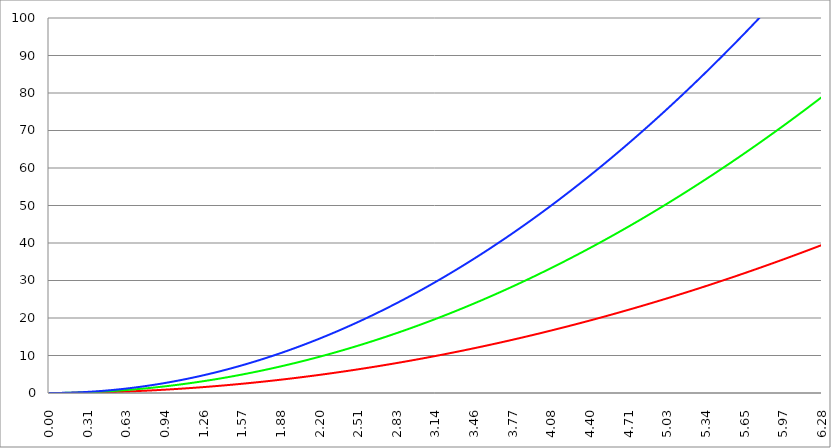
| Category | Series 1 | Series 0 | Series 2 |
|---|---|---|---|
| 0.0 | 0 | 0 | 0 |
| 0.00314159265358979 | 0 | 0 | 0 |
| 0.00628318530717958 | 0 | 0 | 0 |
| 0.00942477796076938 | 0 | 0 | 0 |
| 0.0125663706143592 | 0 | 0 | 0 |
| 0.015707963267949 | 0 | 0 | 0.001 |
| 0.0188495559215388 | 0 | 0.001 | 0.001 |
| 0.0219911485751285 | 0 | 0.001 | 0.001 |
| 0.0251327412287183 | 0.001 | 0.001 | 0.002 |
| 0.0282743338823081 | 0.001 | 0.002 | 0.002 |
| 0.0314159265358979 | 0.001 | 0.002 | 0.003 |
| 0.0345575191894877 | 0.001 | 0.002 | 0.004 |
| 0.0376991118430775 | 0.001 | 0.003 | 0.004 |
| 0.0408407044966673 | 0.002 | 0.003 | 0.005 |
| 0.0439822971502571 | 0.002 | 0.004 | 0.006 |
| 0.0471238898038469 | 0.002 | 0.004 | 0.007 |
| 0.0502654824574367 | 0.003 | 0.005 | 0.008 |
| 0.0534070751110265 | 0.003 | 0.006 | 0.009 |
| 0.0565486677646163 | 0.003 | 0.006 | 0.01 |
| 0.059690260418206 | 0.004 | 0.007 | 0.011 |
| 0.0628318530717958 | 0.004 | 0.008 | 0.012 |
| 0.0659734457253856 | 0.004 | 0.009 | 0.013 |
| 0.0691150383789754 | 0.005 | 0.01 | 0.014 |
| 0.0722566310325652 | 0.005 | 0.01 | 0.016 |
| 0.075398223686155 | 0.006 | 0.011 | 0.017 |
| 0.0785398163397448 | 0.006 | 0.012 | 0.019 |
| 0.0816814089933346 | 0.007 | 0.013 | 0.02 |
| 0.0848230016469244 | 0.007 | 0.014 | 0.022 |
| 0.0879645943005142 | 0.008 | 0.015 | 0.023 |
| 0.091106186954104 | 0.008 | 0.017 | 0.025 |
| 0.0942477796076937 | 0.009 | 0.018 | 0.027 |
| 0.0973893722612835 | 0.009 | 0.019 | 0.028 |
| 0.100530964914873 | 0.01 | 0.02 | 0.03 |
| 0.103672557568463 | 0.011 | 0.021 | 0.032 |
| 0.106814150222053 | 0.011 | 0.023 | 0.034 |
| 0.109955742875643 | 0.012 | 0.024 | 0.036 |
| 0.113097335529233 | 0.013 | 0.026 | 0.038 |
| 0.116238928182822 | 0.014 | 0.027 | 0.041 |
| 0.119380520836412 | 0.014 | 0.029 | 0.043 |
| 0.122522113490002 | 0.015 | 0.03 | 0.045 |
| 0.125663706143592 | 0.016 | 0.032 | 0.047 |
| 0.128805298797181 | 0.017 | 0.033 | 0.05 |
| 0.131946891450771 | 0.017 | 0.035 | 0.052 |
| 0.135088484104361 | 0.018 | 0.036 | 0.055 |
| 0.138230076757951 | 0.019 | 0.038 | 0.057 |
| 0.141371669411541 | 0.02 | 0.04 | 0.06 |
| 0.14451326206513 | 0.021 | 0.042 | 0.063 |
| 0.14765485471872 | 0.022 | 0.044 | 0.065 |
| 0.15079644737231 | 0.023 | 0.045 | 0.068 |
| 0.1539380400259 | 0.024 | 0.047 | 0.071 |
| 0.15707963267949 | 0.025 | 0.049 | 0.074 |
| 0.160221225333079 | 0.026 | 0.051 | 0.077 |
| 0.163362817986669 | 0.027 | 0.053 | 0.08 |
| 0.166504410640259 | 0.028 | 0.055 | 0.083 |
| 0.169646003293849 | 0.029 | 0.058 | 0.086 |
| 0.172787595947439 | 0.03 | 0.06 | 0.09 |
| 0.175929188601028 | 0.031 | 0.062 | 0.093 |
| 0.179070781254618 | 0.032 | 0.064 | 0.096 |
| 0.182212373908208 | 0.033 | 0.066 | 0.1 |
| 0.185353966561798 | 0.034 | 0.069 | 0.103 |
| 0.188495559215388 | 0.036 | 0.071 | 0.107 |
| 0.191637151868977 | 0.037 | 0.073 | 0.11 |
| 0.194778744522567 | 0.038 | 0.076 | 0.114 |
| 0.197920337176157 | 0.039 | 0.078 | 0.118 |
| 0.201061929829747 | 0.04 | 0.081 | 0.121 |
| 0.204203522483336 | 0.042 | 0.083 | 0.125 |
| 0.207345115136926 | 0.043 | 0.086 | 0.129 |
| 0.210486707790516 | 0.044 | 0.089 | 0.133 |
| 0.213628300444106 | 0.046 | 0.091 | 0.137 |
| 0.216769893097696 | 0.047 | 0.094 | 0.141 |
| 0.219911485751285 | 0.048 | 0.097 | 0.145 |
| 0.223053078404875 | 0.05 | 0.1 | 0.149 |
| 0.226194671058465 | 0.051 | 0.102 | 0.153 |
| 0.229336263712055 | 0.053 | 0.105 | 0.158 |
| 0.232477856365645 | 0.054 | 0.108 | 0.162 |
| 0.235619449019234 | 0.056 | 0.111 | 0.167 |
| 0.238761041672824 | 0.057 | 0.114 | 0.171 |
| 0.241902634326414 | 0.059 | 0.117 | 0.176 |
| 0.245044226980004 | 0.06 | 0.12 | 0.18 |
| 0.248185819633594 | 0.062 | 0.123 | 0.185 |
| 0.251327412287183 | 0.063 | 0.126 | 0.189 |
| 0.254469004940773 | 0.065 | 0.13 | 0.194 |
| 0.257610597594363 | 0.066 | 0.133 | 0.199 |
| 0.260752190247953 | 0.068 | 0.136 | 0.204 |
| 0.263893782901543 | 0.07 | 0.139 | 0.209 |
| 0.267035375555132 | 0.071 | 0.143 | 0.214 |
| 0.270176968208722 | 0.073 | 0.146 | 0.219 |
| 0.273318560862312 | 0.075 | 0.149 | 0.224 |
| 0.276460153515902 | 0.076 | 0.153 | 0.229 |
| 0.279601746169492 | 0.078 | 0.156 | 0.235 |
| 0.282743338823082 | 0.08 | 0.16 | 0.24 |
| 0.285884931476671 | 0.082 | 0.163 | 0.245 |
| 0.289026524130261 | 0.084 | 0.167 | 0.251 |
| 0.292168116783851 | 0.085 | 0.171 | 0.256 |
| 0.295309709437441 | 0.087 | 0.174 | 0.262 |
| 0.298451302091031 | 0.089 | 0.178 | 0.267 |
| 0.30159289474462 | 0.091 | 0.182 | 0.273 |
| 0.30473448739821 | 0.093 | 0.186 | 0.279 |
| 0.3078760800518 | 0.095 | 0.19 | 0.284 |
| 0.31101767270539 | 0.097 | 0.193 | 0.29 |
| 0.31415926535898 | 0.099 | 0.197 | 0.296 |
| 0.31730085801257 | 0.101 | 0.201 | 0.302 |
| 0.320442450666159 | 0.103 | 0.205 | 0.308 |
| 0.323584043319749 | 0.105 | 0.209 | 0.314 |
| 0.326725635973339 | 0.107 | 0.213 | 0.32 |
| 0.329867228626929 | 0.109 | 0.218 | 0.326 |
| 0.333008821280519 | 0.111 | 0.222 | 0.333 |
| 0.336150413934108 | 0.113 | 0.226 | 0.339 |
| 0.339292006587698 | 0.115 | 0.23 | 0.345 |
| 0.342433599241288 | 0.117 | 0.235 | 0.352 |
| 0.345575191894878 | 0.119 | 0.239 | 0.358 |
| 0.348716784548468 | 0.122 | 0.243 | 0.365 |
| 0.351858377202058 | 0.124 | 0.248 | 0.371 |
| 0.354999969855647 | 0.126 | 0.252 | 0.378 |
| 0.358141562509237 | 0.128 | 0.257 | 0.385 |
| 0.361283155162827 | 0.131 | 0.261 | 0.392 |
| 0.364424747816417 | 0.133 | 0.266 | 0.398 |
| 0.367566340470007 | 0.135 | 0.27 | 0.405 |
| 0.370707933123597 | 0.137 | 0.275 | 0.412 |
| 0.373849525777186 | 0.14 | 0.28 | 0.419 |
| 0.376991118430776 | 0.142 | 0.284 | 0.426 |
| 0.380132711084366 | 0.145 | 0.289 | 0.434 |
| 0.383274303737956 | 0.147 | 0.294 | 0.441 |
| 0.386415896391546 | 0.149 | 0.299 | 0.448 |
| 0.389557489045135 | 0.152 | 0.304 | 0.455 |
| 0.392699081698725 | 0.154 | 0.308 | 0.463 |
| 0.395840674352315 | 0.157 | 0.313 | 0.47 |
| 0.398982267005905 | 0.159 | 0.318 | 0.478 |
| 0.402123859659495 | 0.162 | 0.323 | 0.485 |
| 0.405265452313085 | 0.164 | 0.328 | 0.493 |
| 0.408407044966674 | 0.167 | 0.334 | 0.5 |
| 0.411548637620264 | 0.169 | 0.339 | 0.508 |
| 0.414690230273854 | 0.172 | 0.344 | 0.516 |
| 0.417831822927444 | 0.175 | 0.349 | 0.524 |
| 0.420973415581034 | 0.177 | 0.354 | 0.532 |
| 0.424115008234623 | 0.18 | 0.36 | 0.54 |
| 0.427256600888213 | 0.183 | 0.365 | 0.548 |
| 0.430398193541803 | 0.185 | 0.37 | 0.556 |
| 0.433539786195393 | 0.188 | 0.376 | 0.564 |
| 0.436681378848983 | 0.191 | 0.381 | 0.572 |
| 0.439822971502573 | 0.193 | 0.387 | 0.58 |
| 0.442964564156162 | 0.196 | 0.392 | 0.589 |
| 0.446106156809752 | 0.199 | 0.398 | 0.597 |
| 0.449247749463342 | 0.202 | 0.404 | 0.605 |
| 0.452389342116932 | 0.205 | 0.409 | 0.614 |
| 0.455530934770522 | 0.208 | 0.415 | 0.623 |
| 0.458672527424111 | 0.21 | 0.421 | 0.631 |
| 0.461814120077701 | 0.213 | 0.427 | 0.64 |
| 0.464955712731291 | 0.216 | 0.432 | 0.649 |
| 0.468097305384881 | 0.219 | 0.438 | 0.657 |
| 0.471238898038471 | 0.222 | 0.444 | 0.666 |
| 0.474380490692061 | 0.225 | 0.45 | 0.675 |
| 0.47752208334565 | 0.228 | 0.456 | 0.684 |
| 0.48066367599924 | 0.231 | 0.462 | 0.693 |
| 0.48380526865283 | 0.234 | 0.468 | 0.702 |
| 0.48694686130642 | 0.237 | 0.474 | 0.711 |
| 0.49008845396001 | 0.24 | 0.48 | 0.721 |
| 0.493230046613599 | 0.243 | 0.487 | 0.73 |
| 0.496371639267189 | 0.246 | 0.493 | 0.739 |
| 0.499513231920779 | 0.25 | 0.499 | 0.749 |
| 0.502654824574369 | 0.253 | 0.505 | 0.758 |
| 0.505796417227959 | 0.256 | 0.512 | 0.767 |
| 0.508938009881549 | 0.259 | 0.518 | 0.777 |
| 0.512079602535138 | 0.262 | 0.524 | 0.787 |
| 0.515221195188728 | 0.265 | 0.531 | 0.796 |
| 0.518362787842318 | 0.269 | 0.537 | 0.806 |
| 0.521504380495908 | 0.272 | 0.544 | 0.816 |
| 0.524645973149498 | 0.275 | 0.551 | 0.826 |
| 0.527787565803087 | 0.279 | 0.557 | 0.836 |
| 0.530929158456677 | 0.282 | 0.564 | 0.846 |
| 0.534070751110267 | 0.285 | 0.57 | 0.856 |
| 0.537212343763857 | 0.289 | 0.577 | 0.866 |
| 0.540353936417447 | 0.292 | 0.584 | 0.876 |
| 0.543495529071037 | 0.295 | 0.591 | 0.886 |
| 0.546637121724626 | 0.299 | 0.598 | 0.896 |
| 0.549778714378216 | 0.302 | 0.605 | 0.907 |
| 0.552920307031806 | 0.306 | 0.611 | 0.917 |
| 0.556061899685396 | 0.309 | 0.618 | 0.928 |
| 0.559203492338986 | 0.313 | 0.625 | 0.938 |
| 0.562345084992576 | 0.316 | 0.632 | 0.949 |
| 0.565486677646165 | 0.32 | 0.64 | 0.959 |
| 0.568628270299755 | 0.323 | 0.647 | 0.97 |
| 0.571769862953345 | 0.327 | 0.654 | 0.981 |
| 0.574911455606935 | 0.331 | 0.661 | 0.992 |
| 0.578053048260525 | 0.334 | 0.668 | 1.002 |
| 0.581194640914114 | 0.338 | 0.676 | 1.013 |
| 0.584336233567704 | 0.341 | 0.683 | 1.024 |
| 0.587477826221294 | 0.345 | 0.69 | 1.035 |
| 0.590619418874884 | 0.349 | 0.698 | 1.046 |
| 0.593761011528474 | 0.353 | 0.705 | 1.058 |
| 0.596902604182064 | 0.356 | 0.713 | 1.069 |
| 0.600044196835653 | 0.36 | 0.72 | 1.08 |
| 0.603185789489243 | 0.364 | 0.728 | 1.091 |
| 0.606327382142833 | 0.368 | 0.735 | 1.103 |
| 0.609468974796423 | 0.371 | 0.743 | 1.114 |
| 0.612610567450013 | 0.375 | 0.751 | 1.126 |
| 0.615752160103602 | 0.379 | 0.758 | 1.137 |
| 0.618893752757192 | 0.383 | 0.766 | 1.149 |
| 0.622035345410782 | 0.387 | 0.774 | 1.161 |
| 0.625176938064372 | 0.391 | 0.782 | 1.173 |
| 0.628318530717962 | 0.395 | 0.79 | 1.184 |
| 0.631460123371551 | 0.399 | 0.797 | 1.196 |
| 0.634601716025141 | 0.403 | 0.805 | 1.208 |
| 0.637743308678731 | 0.407 | 0.813 | 1.22 |
| 0.640884901332321 | 0.411 | 0.821 | 1.232 |
| 0.644026493985911 | 0.415 | 0.83 | 1.244 |
| 0.647168086639501 | 0.419 | 0.838 | 1.256 |
| 0.65030967929309 | 0.423 | 0.846 | 1.269 |
| 0.65345127194668 | 0.427 | 0.854 | 1.281 |
| 0.65659286460027 | 0.431 | 0.862 | 1.293 |
| 0.65973445725386 | 0.435 | 0.87 | 1.306 |
| 0.66287604990745 | 0.439 | 0.879 | 1.318 |
| 0.666017642561039 | 0.444 | 0.887 | 1.331 |
| 0.669159235214629 | 0.448 | 0.896 | 1.343 |
| 0.672300827868219 | 0.452 | 0.904 | 1.356 |
| 0.675442420521809 | 0.456 | 0.912 | 1.369 |
| 0.678584013175399 | 0.46 | 0.921 | 1.381 |
| 0.681725605828989 | 0.465 | 0.929 | 1.394 |
| 0.684867198482578 | 0.469 | 0.938 | 1.407 |
| 0.688008791136168 | 0.473 | 0.947 | 1.42 |
| 0.691150383789758 | 0.478 | 0.955 | 1.433 |
| 0.694291976443348 | 0.482 | 0.964 | 1.446 |
| 0.697433569096938 | 0.486 | 0.973 | 1.459 |
| 0.700575161750528 | 0.491 | 0.982 | 1.472 |
| 0.703716754404117 | 0.495 | 0.99 | 1.486 |
| 0.706858347057707 | 0.5 | 0.999 | 1.499 |
| 0.709999939711297 | 0.504 | 1.008 | 1.512 |
| 0.713141532364887 | 0.509 | 1.017 | 1.526 |
| 0.716283125018477 | 0.513 | 1.026 | 1.539 |
| 0.719424717672066 | 0.518 | 1.035 | 1.553 |
| 0.722566310325656 | 0.522 | 1.044 | 1.566 |
| 0.725707902979246 | 0.527 | 1.053 | 1.58 |
| 0.728849495632836 | 0.531 | 1.062 | 1.594 |
| 0.731991088286426 | 0.536 | 1.072 | 1.607 |
| 0.735132680940016 | 0.54 | 1.081 | 1.621 |
| 0.738274273593605 | 0.545 | 1.09 | 1.635 |
| 0.741415866247195 | 0.55 | 1.099 | 1.649 |
| 0.744557458900785 | 0.554 | 1.109 | 1.663 |
| 0.747699051554375 | 0.559 | 1.118 | 1.677 |
| 0.750840644207965 | 0.564 | 1.128 | 1.691 |
| 0.753982236861554 | 0.568 | 1.137 | 1.705 |
| 0.757123829515144 | 0.573 | 1.146 | 1.72 |
| 0.760265422168734 | 0.578 | 1.156 | 1.734 |
| 0.763407014822324 | 0.583 | 1.166 | 1.748 |
| 0.766548607475914 | 0.588 | 1.175 | 1.763 |
| 0.769690200129504 | 0.592 | 1.185 | 1.777 |
| 0.772831792783093 | 0.597 | 1.195 | 1.792 |
| 0.775973385436683 | 0.602 | 1.204 | 1.806 |
| 0.779114978090273 | 0.607 | 1.214 | 1.821 |
| 0.782256570743863 | 0.612 | 1.224 | 1.836 |
| 0.785398163397453 | 0.617 | 1.234 | 1.851 |
| 0.788539756051042 | 0.622 | 1.244 | 1.865 |
| 0.791681348704632 | 0.627 | 1.254 | 1.88 |
| 0.794822941358222 | 0.632 | 1.263 | 1.895 |
| 0.797964534011812 | 0.637 | 1.273 | 1.91 |
| 0.801106126665402 | 0.642 | 1.284 | 1.925 |
| 0.804247719318992 | 0.647 | 1.294 | 1.94 |
| 0.807389311972581 | 0.652 | 1.304 | 1.956 |
| 0.810530904626171 | 0.657 | 1.314 | 1.971 |
| 0.813672497279761 | 0.662 | 1.324 | 1.986 |
| 0.816814089933351 | 0.667 | 1.334 | 2.002 |
| 0.819955682586941 | 0.672 | 1.345 | 2.017 |
| 0.823097275240531 | 0.677 | 1.355 | 2.032 |
| 0.82623886789412 | 0.683 | 1.365 | 2.048 |
| 0.82938046054771 | 0.688 | 1.376 | 2.064 |
| 0.8325220532013 | 0.693 | 1.386 | 2.079 |
| 0.83566364585489 | 0.698 | 1.397 | 2.095 |
| 0.83880523850848 | 0.704 | 1.407 | 2.111 |
| 0.841946831162069 | 0.709 | 1.418 | 2.127 |
| 0.845088423815659 | 0.714 | 1.428 | 2.143 |
| 0.848230016469249 | 0.719 | 1.439 | 2.158 |
| 0.851371609122839 | 0.725 | 1.45 | 2.175 |
| 0.854513201776429 | 0.73 | 1.46 | 2.191 |
| 0.857654794430019 | 0.736 | 1.471 | 2.207 |
| 0.860796387083608 | 0.741 | 1.482 | 2.223 |
| 0.863937979737198 | 0.746 | 1.493 | 2.239 |
| 0.867079572390788 | 0.752 | 1.504 | 2.255 |
| 0.870221165044378 | 0.757 | 1.515 | 2.272 |
| 0.873362757697968 | 0.763 | 1.526 | 2.288 |
| 0.876504350351557 | 0.768 | 1.537 | 2.305 |
| 0.879645943005147 | 0.774 | 1.548 | 2.321 |
| 0.882787535658737 | 0.779 | 1.559 | 2.338 |
| 0.885929128312327 | 0.785 | 1.57 | 2.355 |
| 0.889070720965917 | 0.79 | 1.581 | 2.371 |
| 0.892212313619507 | 0.796 | 1.592 | 2.388 |
| 0.895353906273096 | 0.802 | 1.603 | 2.405 |
| 0.898495498926686 | 0.807 | 1.615 | 2.422 |
| 0.901637091580276 | 0.813 | 1.626 | 2.439 |
| 0.904778684233866 | 0.819 | 1.637 | 2.456 |
| 0.907920276887456 | 0.824 | 1.649 | 2.473 |
| 0.911061869541045 | 0.83 | 1.66 | 2.49 |
| 0.914203462194635 | 0.836 | 1.672 | 2.507 |
| 0.917345054848225 | 0.842 | 1.683 | 2.525 |
| 0.920486647501815 | 0.847 | 1.695 | 2.542 |
| 0.923628240155405 | 0.853 | 1.706 | 2.559 |
| 0.926769832808995 | 0.859 | 1.718 | 2.577 |
| 0.929911425462584 | 0.865 | 1.729 | 2.594 |
| 0.933053018116174 | 0.871 | 1.741 | 2.612 |
| 0.936194610769764 | 0.876 | 1.753 | 2.629 |
| 0.939336203423354 | 0.882 | 1.765 | 2.647 |
| 0.942477796076944 | 0.888 | 1.777 | 2.665 |
| 0.945619388730533 | 0.894 | 1.788 | 2.683 |
| 0.948760981384123 | 0.9 | 1.8 | 2.7 |
| 0.951902574037713 | 0.906 | 1.812 | 2.718 |
| 0.955044166691303 | 0.912 | 1.824 | 2.736 |
| 0.958185759344893 | 0.918 | 1.836 | 2.754 |
| 0.961327351998483 | 0.924 | 1.848 | 2.772 |
| 0.964468944652072 | 0.93 | 1.86 | 2.791 |
| 0.967610537305662 | 0.936 | 1.873 | 2.809 |
| 0.970752129959252 | 0.942 | 1.885 | 2.827 |
| 0.973893722612842 | 0.948 | 1.897 | 2.845 |
| 0.977035315266432 | 0.955 | 1.909 | 2.864 |
| 0.980176907920022 | 0.961 | 1.921 | 2.882 |
| 0.983318500573611 | 0.967 | 1.934 | 2.901 |
| 0.986460093227201 | 0.973 | 1.946 | 2.919 |
| 0.989601685880791 | 0.979 | 1.959 | 2.938 |
| 0.992743278534381 | 0.986 | 1.971 | 2.957 |
| 0.995884871187971 | 0.992 | 1.984 | 2.975 |
| 0.99902646384156 | 0.998 | 1.996 | 2.994 |
| 1.00216805649515 | 1.004 | 2.009 | 3.013 |
| 1.00530964914874 | 1.011 | 2.021 | 3.032 |
| 1.00845124180233 | 1.017 | 2.034 | 3.051 |
| 1.01159283445592 | 1.023 | 2.047 | 3.07 |
| 1.01473442710951 | 1.03 | 2.059 | 3.089 |
| 1.017876019763099 | 1.036 | 2.072 | 3.108 |
| 1.021017612416689 | 1.042 | 2.085 | 3.127 |
| 1.02415920507028 | 1.049 | 2.098 | 3.147 |
| 1.027300797723869 | 1.055 | 2.111 | 3.166 |
| 1.030442390377459 | 1.062 | 2.124 | 3.185 |
| 1.033583983031048 | 1.068 | 2.137 | 3.205 |
| 1.036725575684638 | 1.075 | 2.15 | 3.224 |
| 1.039867168338228 | 1.081 | 2.163 | 3.244 |
| 1.043008760991818 | 1.088 | 2.176 | 3.264 |
| 1.046150353645408 | 1.094 | 2.189 | 3.283 |
| 1.049291946298998 | 1.101 | 2.202 | 3.303 |
| 1.052433538952587 | 1.108 | 2.215 | 3.323 |
| 1.055575131606177 | 1.114 | 2.228 | 3.343 |
| 1.058716724259767 | 1.121 | 2.242 | 3.363 |
| 1.061858316913357 | 1.128 | 2.255 | 3.383 |
| 1.064999909566947 | 1.134 | 2.268 | 3.403 |
| 1.068141502220536 | 1.141 | 2.282 | 3.423 |
| 1.071283094874126 | 1.148 | 2.295 | 3.443 |
| 1.074424687527716 | 1.154 | 2.309 | 3.463 |
| 1.077566280181306 | 1.161 | 2.322 | 3.483 |
| 1.080707872834896 | 1.168 | 2.336 | 3.504 |
| 1.083849465488486 | 1.175 | 2.349 | 3.524 |
| 1.086991058142075 | 1.182 | 2.363 | 3.545 |
| 1.090132650795665 | 1.188 | 2.377 | 3.565 |
| 1.093274243449255 | 1.195 | 2.39 | 3.586 |
| 1.096415836102845 | 1.202 | 2.404 | 3.606 |
| 1.099557428756435 | 1.209 | 2.418 | 3.627 |
| 1.102699021410025 | 1.216 | 2.432 | 3.648 |
| 1.105840614063614 | 1.223 | 2.446 | 3.669 |
| 1.108982206717204 | 1.23 | 2.46 | 3.69 |
| 1.112123799370794 | 1.237 | 2.474 | 3.71 |
| 1.115265392024384 | 1.244 | 2.488 | 3.731 |
| 1.118406984677974 | 1.251 | 2.502 | 3.753 |
| 1.121548577331563 | 1.258 | 2.516 | 3.774 |
| 1.124690169985153 | 1.265 | 2.53 | 3.795 |
| 1.127831762638743 | 1.272 | 2.544 | 3.816 |
| 1.130973355292333 | 1.279 | 2.558 | 3.837 |
| 1.134114947945923 | 1.286 | 2.572 | 3.859 |
| 1.137256540599513 | 1.293 | 2.587 | 3.88 |
| 1.140398133253102 | 1.301 | 2.601 | 3.902 |
| 1.143539725906692 | 1.308 | 2.615 | 3.923 |
| 1.146681318560282 | 1.315 | 2.63 | 3.945 |
| 1.149822911213872 | 1.322 | 2.644 | 3.966 |
| 1.152964503867462 | 1.329 | 2.659 | 3.988 |
| 1.156106096521051 | 1.337 | 2.673 | 4.01 |
| 1.159247689174641 | 1.344 | 2.688 | 4.032 |
| 1.162389281828231 | 1.351 | 2.702 | 4.053 |
| 1.165530874481821 | 1.358 | 2.717 | 4.075 |
| 1.168672467135411 | 1.366 | 2.732 | 4.097 |
| 1.171814059789001 | 1.373 | 2.746 | 4.119 |
| 1.17495565244259 | 1.381 | 2.761 | 4.142 |
| 1.17809724509618 | 1.388 | 2.776 | 4.164 |
| 1.18123883774977 | 1.395 | 2.791 | 4.186 |
| 1.18438043040336 | 1.403 | 2.806 | 4.208 |
| 1.18752202305695 | 1.41 | 2.82 | 4.231 |
| 1.190663615710539 | 1.418 | 2.835 | 4.253 |
| 1.193805208364129 | 1.425 | 2.85 | 4.276 |
| 1.19694680101772 | 1.433 | 2.865 | 4.298 |
| 1.200088393671309 | 1.44 | 2.88 | 4.321 |
| 1.203229986324899 | 1.448 | 2.896 | 4.343 |
| 1.206371578978489 | 1.455 | 2.911 | 4.366 |
| 1.209513171632078 | 1.463 | 2.926 | 4.389 |
| 1.212654764285668 | 1.471 | 2.941 | 4.412 |
| 1.215796356939258 | 1.478 | 2.956 | 4.434 |
| 1.218937949592848 | 1.486 | 2.972 | 4.457 |
| 1.222079542246438 | 1.493 | 2.987 | 4.48 |
| 1.225221134900027 | 1.501 | 3.002 | 4.504 |
| 1.228362727553617 | 1.509 | 3.018 | 4.527 |
| 1.231504320207207 | 1.517 | 3.033 | 4.55 |
| 1.234645912860797 | 1.524 | 3.049 | 4.573 |
| 1.237787505514387 | 1.532 | 3.064 | 4.596 |
| 1.240929098167977 | 1.54 | 3.08 | 4.62 |
| 1.244070690821566 | 1.548 | 3.095 | 4.643 |
| 1.247212283475156 | 1.556 | 3.111 | 4.667 |
| 1.250353876128746 | 1.563 | 3.127 | 4.69 |
| 1.253495468782336 | 1.571 | 3.143 | 4.714 |
| 1.256637061435926 | 1.579 | 3.158 | 4.737 |
| 1.259778654089515 | 1.587 | 3.174 | 4.761 |
| 1.262920246743105 | 1.595 | 3.19 | 4.785 |
| 1.266061839396695 | 1.603 | 3.206 | 4.809 |
| 1.269203432050285 | 1.611 | 3.222 | 4.833 |
| 1.272345024703875 | 1.619 | 3.238 | 4.857 |
| 1.275486617357465 | 1.627 | 3.254 | 4.881 |
| 1.278628210011054 | 1.635 | 3.27 | 4.905 |
| 1.281769802664644 | 1.643 | 3.286 | 4.929 |
| 1.284911395318234 | 1.651 | 3.302 | 4.953 |
| 1.288052987971824 | 1.659 | 3.318 | 4.977 |
| 1.291194580625414 | 1.667 | 3.334 | 5.002 |
| 1.294336173279003 | 1.675 | 3.351 | 5.026 |
| 1.297477765932593 | 1.683 | 3.367 | 5.05 |
| 1.300619358586183 | 1.692 | 3.383 | 5.075 |
| 1.303760951239773 | 1.7 | 3.4 | 5.099 |
| 1.306902543893363 | 1.708 | 3.416 | 5.124 |
| 1.310044136546953 | 1.716 | 3.432 | 5.149 |
| 1.313185729200542 | 1.724 | 3.449 | 5.173 |
| 1.316327321854132 | 1.733 | 3.465 | 5.198 |
| 1.319468914507722 | 1.741 | 3.482 | 5.223 |
| 1.322610507161312 | 1.749 | 3.499 | 5.248 |
| 1.325752099814902 | 1.758 | 3.515 | 5.273 |
| 1.328893692468491 | 1.766 | 3.532 | 5.298 |
| 1.332035285122081 | 1.774 | 3.549 | 5.323 |
| 1.335176877775671 | 1.783 | 3.565 | 5.348 |
| 1.338318470429261 | 1.791 | 3.582 | 5.373 |
| 1.341460063082851 | 1.8 | 3.599 | 5.399 |
| 1.344601655736441 | 1.808 | 3.616 | 5.424 |
| 1.34774324839003 | 1.816 | 3.633 | 5.449 |
| 1.35088484104362 | 1.825 | 3.65 | 5.475 |
| 1.35402643369721 | 1.833 | 3.667 | 5.5 |
| 1.3571680263508 | 1.842 | 3.684 | 5.526 |
| 1.36030961900439 | 1.85 | 3.701 | 5.551 |
| 1.363451211657979 | 1.859 | 3.718 | 5.577 |
| 1.36659280431157 | 1.868 | 3.735 | 5.603 |
| 1.369734396965159 | 1.876 | 3.752 | 5.629 |
| 1.372875989618749 | 1.885 | 3.77 | 5.654 |
| 1.376017582272339 | 1.893 | 3.787 | 5.68 |
| 1.379159174925929 | 1.902 | 3.804 | 5.706 |
| 1.382300767579518 | 1.911 | 3.822 | 5.732 |
| 1.385442360233108 | 1.919 | 3.839 | 5.758 |
| 1.388583952886698 | 1.928 | 3.856 | 5.784 |
| 1.391725545540288 | 1.937 | 3.874 | 5.811 |
| 1.394867138193878 | 1.946 | 3.891 | 5.837 |
| 1.398008730847468 | 1.954 | 3.909 | 5.863 |
| 1.401150323501057 | 1.963 | 3.926 | 5.89 |
| 1.404291916154647 | 1.972 | 3.944 | 5.916 |
| 1.407433508808237 | 1.981 | 3.962 | 5.943 |
| 1.410575101461827 | 1.99 | 3.979 | 5.969 |
| 1.413716694115417 | 1.999 | 3.997 | 5.996 |
| 1.416858286769006 | 2.007 | 4.015 | 6.022 |
| 1.419999879422596 | 2.016 | 4.033 | 6.049 |
| 1.423141472076186 | 2.025 | 4.051 | 6.076 |
| 1.426283064729776 | 2.034 | 4.069 | 6.103 |
| 1.429424657383366 | 2.043 | 4.087 | 6.13 |
| 1.432566250036956 | 2.052 | 4.104 | 6.157 |
| 1.435707842690545 | 2.061 | 4.123 | 6.184 |
| 1.438849435344135 | 2.07 | 4.141 | 6.211 |
| 1.441991027997725 | 2.079 | 4.159 | 6.238 |
| 1.445132620651315 | 2.088 | 4.177 | 6.265 |
| 1.448274213304905 | 2.097 | 4.195 | 6.292 |
| 1.451415805958494 | 2.107 | 4.213 | 6.32 |
| 1.454557398612084 | 2.116 | 4.231 | 6.347 |
| 1.457698991265674 | 2.125 | 4.25 | 6.375 |
| 1.460840583919264 | 2.134 | 4.268 | 6.402 |
| 1.463982176572854 | 2.143 | 4.286 | 6.43 |
| 1.467123769226444 | 2.152 | 4.305 | 6.457 |
| 1.470265361880033 | 2.162 | 4.323 | 6.485 |
| 1.473406954533623 | 2.171 | 4.342 | 6.513 |
| 1.476548547187213 | 2.18 | 4.36 | 6.541 |
| 1.479690139840803 | 2.189 | 4.379 | 6.568 |
| 1.482831732494393 | 2.199 | 4.398 | 6.596 |
| 1.485973325147982 | 2.208 | 4.416 | 6.624 |
| 1.489114917801572 | 2.217 | 4.435 | 6.652 |
| 1.492256510455162 | 2.227 | 4.454 | 6.68 |
| 1.495398103108752 | 2.236 | 4.472 | 6.709 |
| 1.498539695762342 | 2.246 | 4.491 | 6.737 |
| 1.501681288415932 | 2.255 | 4.51 | 6.765 |
| 1.504822881069521 | 2.264 | 4.529 | 6.793 |
| 1.507964473723111 | 2.274 | 4.548 | 6.822 |
| 1.511106066376701 | 2.283 | 4.567 | 6.85 |
| 1.514247659030291 | 2.293 | 4.586 | 6.879 |
| 1.517389251683881 | 2.302 | 4.605 | 6.907 |
| 1.520530844337471 | 2.312 | 4.624 | 6.936 |
| 1.52367243699106 | 2.322 | 4.643 | 6.965 |
| 1.52681402964465 | 2.331 | 4.662 | 6.993 |
| 1.52995562229824 | 2.341 | 4.682 | 7.022 |
| 1.53309721495183 | 2.35 | 4.701 | 7.051 |
| 1.53623880760542 | 2.36 | 4.72 | 7.08 |
| 1.539380400259009 | 2.37 | 4.739 | 7.109 |
| 1.542521992912599 | 2.379 | 4.759 | 7.138 |
| 1.545663585566189 | 2.389 | 4.778 | 7.167 |
| 1.548805178219779 | 2.399 | 4.798 | 7.196 |
| 1.551946770873369 | 2.409 | 4.817 | 7.226 |
| 1.555088363526959 | 2.418 | 4.837 | 7.255 |
| 1.558229956180548 | 2.428 | 4.856 | 7.284 |
| 1.561371548834138 | 2.438 | 4.876 | 7.314 |
| 1.564513141487728 | 2.448 | 4.895 | 7.343 |
| 1.567654734141318 | 2.458 | 4.915 | 7.373 |
| 1.570796326794908 | 2.467 | 4.935 | 7.402 |
| 1.573937919448497 | 2.477 | 4.955 | 7.432 |
| 1.577079512102087 | 2.487 | 4.974 | 7.462 |
| 1.580221104755677 | 2.497 | 4.994 | 7.491 |
| 1.583362697409267 | 2.507 | 5.014 | 7.521 |
| 1.586504290062857 | 2.517 | 5.034 | 7.551 |
| 1.589645882716447 | 2.527 | 5.054 | 7.581 |
| 1.592787475370036 | 2.537 | 5.074 | 7.611 |
| 1.595929068023626 | 2.547 | 5.094 | 7.641 |
| 1.599070660677216 | 2.557 | 5.114 | 7.671 |
| 1.602212253330806 | 2.567 | 5.134 | 7.701 |
| 1.605353845984396 | 2.577 | 5.154 | 7.731 |
| 1.608495438637985 | 2.587 | 5.175 | 7.762 |
| 1.611637031291575 | 2.597 | 5.195 | 7.792 |
| 1.614778623945165 | 2.608 | 5.215 | 7.823 |
| 1.617920216598755 | 2.618 | 5.235 | 7.853 |
| 1.621061809252345 | 2.628 | 5.256 | 7.884 |
| 1.624203401905935 | 2.638 | 5.276 | 7.914 |
| 1.627344994559524 | 2.648 | 5.297 | 7.945 |
| 1.630486587213114 | 2.658 | 5.317 | 7.975 |
| 1.633628179866704 | 2.669 | 5.337 | 8.006 |
| 1.636769772520294 | 2.679 | 5.358 | 8.037 |
| 1.639911365173884 | 2.689 | 5.379 | 8.068 |
| 1.643052957827473 | 2.7 | 5.399 | 8.099 |
| 1.646194550481063 | 2.71 | 5.42 | 8.13 |
| 1.649336143134653 | 2.72 | 5.441 | 8.161 |
| 1.652477735788243 | 2.731 | 5.461 | 8.192 |
| 1.655619328441833 | 2.741 | 5.482 | 8.223 |
| 1.658760921095423 | 2.751 | 5.503 | 8.254 |
| 1.661902513749012 | 2.762 | 5.524 | 8.286 |
| 1.665044106402602 | 2.772 | 5.545 | 8.317 |
| 1.668185699056192 | 2.783 | 5.566 | 8.349 |
| 1.671327291709782 | 2.793 | 5.587 | 8.38 |
| 1.674468884363372 | 2.804 | 5.608 | 8.412 |
| 1.677610477016961 | 2.814 | 5.629 | 8.443 |
| 1.680752069670551 | 2.825 | 5.65 | 8.475 |
| 1.683893662324141 | 2.835 | 5.671 | 8.506 |
| 1.687035254977731 | 2.846 | 5.692 | 8.538 |
| 1.690176847631321 | 2.857 | 5.713 | 8.57 |
| 1.693318440284911 | 2.867 | 5.735 | 8.602 |
| 1.6964600329385 | 2.878 | 5.756 | 8.634 |
| 1.69960162559209 | 2.889 | 5.777 | 8.666 |
| 1.70274321824568 | 2.899 | 5.799 | 8.698 |
| 1.70588481089927 | 2.91 | 5.82 | 8.73 |
| 1.70902640355286 | 2.921 | 5.842 | 8.762 |
| 1.712167996206449 | 2.932 | 5.863 | 8.795 |
| 1.715309588860039 | 2.942 | 5.885 | 8.827 |
| 1.71845118151363 | 2.953 | 5.906 | 8.859 |
| 1.721592774167219 | 2.964 | 5.928 | 8.892 |
| 1.724734366820809 | 2.975 | 5.949 | 8.924 |
| 1.727875959474399 | 2.986 | 5.971 | 8.957 |
| 1.731017552127988 | 2.996 | 5.993 | 8.989 |
| 1.734159144781578 | 3.007 | 6.015 | 9.022 |
| 1.737300737435168 | 3.018 | 6.036 | 9.055 |
| 1.740442330088758 | 3.029 | 6.058 | 9.087 |
| 1.743583922742348 | 3.04 | 6.08 | 9.12 |
| 1.746725515395937 | 3.051 | 6.102 | 9.153 |
| 1.749867108049527 | 3.062 | 6.124 | 9.186 |
| 1.753008700703117 | 3.073 | 6.146 | 9.219 |
| 1.756150293356707 | 3.084 | 6.168 | 9.252 |
| 1.759291886010297 | 3.095 | 6.19 | 9.285 |
| 1.762433478663887 | 3.106 | 6.212 | 9.319 |
| 1.765575071317476 | 3.117 | 6.235 | 9.352 |
| 1.768716663971066 | 3.128 | 6.257 | 9.385 |
| 1.771858256624656 | 3.139 | 6.279 | 9.418 |
| 1.774999849278246 | 3.151 | 6.301 | 9.452 |
| 1.778141441931836 | 3.162 | 6.324 | 9.485 |
| 1.781283034585426 | 3.173 | 6.346 | 9.519 |
| 1.784424627239015 | 3.184 | 6.368 | 9.553 |
| 1.787566219892605 | 3.195 | 6.391 | 9.586 |
| 1.790707812546195 | 3.207 | 6.413 | 9.62 |
| 1.793849405199785 | 3.218 | 6.436 | 9.654 |
| 1.796990997853375 | 3.229 | 6.458 | 9.688 |
| 1.800132590506964 | 3.24 | 6.481 | 9.721 |
| 1.803274183160554 | 3.252 | 6.504 | 9.755 |
| 1.806415775814144 | 3.263 | 6.526 | 9.789 |
| 1.809557368467734 | 3.274 | 6.549 | 9.823 |
| 1.812698961121324 | 3.286 | 6.572 | 9.858 |
| 1.815840553774914 | 3.297 | 6.595 | 9.892 |
| 1.818982146428503 | 3.309 | 6.617 | 9.926 |
| 1.822123739082093 | 3.32 | 6.64 | 9.96 |
| 1.825265331735683 | 3.332 | 6.663 | 9.995 |
| 1.828406924389273 | 3.343 | 6.686 | 10.029 |
| 1.831548517042863 | 3.355 | 6.709 | 10.064 |
| 1.834690109696452 | 3.366 | 6.732 | 10.098 |
| 1.837831702350042 | 3.378 | 6.755 | 10.133 |
| 1.840973295003632 | 3.389 | 6.778 | 10.168 |
| 1.844114887657222 | 3.401 | 6.802 | 10.202 |
| 1.847256480310812 | 3.412 | 6.825 | 10.237 |
| 1.850398072964402 | 3.424 | 6.848 | 10.272 |
| 1.853539665617991 | 3.436 | 6.871 | 10.307 |
| 1.856681258271581 | 3.447 | 6.895 | 10.342 |
| 1.859822850925171 | 3.459 | 6.918 | 10.377 |
| 1.862964443578761 | 3.471 | 6.941 | 10.412 |
| 1.866106036232351 | 3.482 | 6.965 | 10.447 |
| 1.86924762888594 | 3.494 | 6.988 | 10.482 |
| 1.87238922153953 | 3.506 | 7.012 | 10.518 |
| 1.87553081419312 | 3.518 | 7.035 | 10.553 |
| 1.87867240684671 | 3.529 | 7.059 | 10.588 |
| 1.8818139995003 | 3.541 | 7.082 | 10.624 |
| 1.88495559215389 | 3.553 | 7.106 | 10.659 |
| 1.888097184807479 | 3.565 | 7.13 | 10.695 |
| 1.891238777461069 | 3.577 | 7.154 | 10.73 |
| 1.89438037011466 | 3.589 | 7.177 | 10.766 |
| 1.897521962768249 | 3.601 | 7.201 | 10.802 |
| 1.900663555421839 | 3.613 | 7.225 | 10.838 |
| 1.903805148075429 | 3.624 | 7.249 | 10.873 |
| 1.906946740729018 | 3.636 | 7.273 | 10.909 |
| 1.910088333382608 | 3.648 | 7.297 | 10.945 |
| 1.913229926036198 | 3.66 | 7.321 | 10.981 |
| 1.916371518689788 | 3.672 | 7.345 | 11.017 |
| 1.919513111343378 | 3.685 | 7.369 | 11.054 |
| 1.922654703996967 | 3.697 | 7.393 | 11.09 |
| 1.925796296650557 | 3.709 | 7.417 | 11.126 |
| 1.928937889304147 | 3.721 | 7.442 | 11.162 |
| 1.932079481957737 | 3.733 | 7.466 | 11.199 |
| 1.935221074611327 | 3.745 | 7.49 | 11.235 |
| 1.938362667264917 | 3.757 | 7.514 | 11.272 |
| 1.941504259918506 | 3.769 | 7.539 | 11.308 |
| 1.944645852572096 | 3.782 | 7.563 | 11.345 |
| 1.947787445225686 | 3.794 | 7.588 | 11.382 |
| 1.950929037879276 | 3.806 | 7.612 | 11.418 |
| 1.954070630532866 | 3.818 | 7.637 | 11.455 |
| 1.957212223186455 | 3.831 | 7.661 | 11.492 |
| 1.960353815840045 | 3.843 | 7.686 | 11.529 |
| 1.963495408493635 | 3.855 | 7.711 | 11.566 |
| 1.966637001147225 | 3.868 | 7.735 | 11.603 |
| 1.969778593800815 | 3.88 | 7.76 | 11.64 |
| 1.972920186454405 | 3.892 | 7.785 | 11.677 |
| 1.976061779107994 | 3.905 | 7.81 | 11.714 |
| 1.979203371761584 | 3.917 | 7.834 | 11.752 |
| 1.982344964415174 | 3.93 | 7.859 | 11.789 |
| 1.985486557068764 | 3.942 | 7.884 | 11.826 |
| 1.988628149722354 | 3.955 | 7.909 | 11.864 |
| 1.991769742375943 | 3.967 | 7.934 | 11.901 |
| 1.994911335029533 | 3.98 | 7.959 | 11.939 |
| 1.998052927683123 | 3.992 | 7.984 | 11.977 |
| 2.001194520336712 | 4.005 | 8.01 | 12.014 |
| 2.004336112990302 | 4.017 | 8.035 | 12.052 |
| 2.007477705643892 | 4.03 | 8.06 | 12.09 |
| 2.010619298297482 | 4.043 | 8.085 | 12.128 |
| 2.013760890951071 | 4.055 | 8.11 | 12.166 |
| 2.016902483604661 | 4.068 | 8.136 | 12.204 |
| 2.02004407625825 | 4.081 | 8.161 | 12.242 |
| 2.02318566891184 | 4.093 | 8.187 | 12.28 |
| 2.02632726156543 | 4.106 | 8.212 | 12.318 |
| 2.029468854219019 | 4.119 | 8.237 | 12.356 |
| 2.032610446872609 | 4.132 | 8.263 | 12.395 |
| 2.035752039526198 | 4.144 | 8.289 | 12.433 |
| 2.038893632179788 | 4.157 | 8.314 | 12.471 |
| 2.042035224833378 | 4.17 | 8.34 | 12.51 |
| 2.045176817486967 | 4.183 | 8.365 | 12.548 |
| 2.048318410140557 | 4.196 | 8.391 | 12.587 |
| 2.051460002794146 | 4.208 | 8.417 | 12.625 |
| 2.054601595447736 | 4.221 | 8.443 | 12.664 |
| 2.057743188101325 | 4.234 | 8.469 | 12.703 |
| 2.060884780754915 | 4.247 | 8.494 | 12.742 |
| 2.064026373408505 | 4.26 | 8.52 | 12.781 |
| 2.067167966062094 | 4.273 | 8.546 | 12.82 |
| 2.070309558715684 | 4.286 | 8.572 | 12.859 |
| 2.073451151369273 | 4.299 | 8.598 | 12.898 |
| 2.076592744022863 | 4.312 | 8.624 | 12.937 |
| 2.079734336676452 | 4.325 | 8.651 | 12.976 |
| 2.082875929330042 | 4.338 | 8.677 | 13.015 |
| 2.086017521983632 | 4.351 | 8.703 | 13.054 |
| 2.089159114637221 | 4.365 | 8.729 | 13.094 |
| 2.092300707290811 | 4.378 | 8.755 | 13.133 |
| 2.095442299944401 | 4.391 | 8.782 | 13.173 |
| 2.09858389259799 | 4.404 | 8.808 | 13.212 |
| 2.10172548525158 | 4.417 | 8.835 | 13.252 |
| 2.104867077905169 | 4.43 | 8.861 | 13.291 |
| 2.108008670558759 | 4.444 | 8.887 | 13.331 |
| 2.111150263212349 | 4.457 | 8.914 | 13.371 |
| 2.114291855865938 | 4.47 | 8.94 | 13.411 |
| 2.117433448519528 | 4.484 | 8.967 | 13.451 |
| 2.120575041173117 | 4.497 | 8.994 | 13.491 |
| 2.123716633826707 | 4.51 | 9.02 | 13.531 |
| 2.126858226480297 | 4.524 | 9.047 | 13.571 |
| 2.129999819133886 | 4.537 | 9.074 | 13.611 |
| 2.133141411787476 | 4.55 | 9.101 | 13.651 |
| 2.136283004441065 | 4.564 | 9.127 | 13.691 |
| 2.139424597094655 | 4.577 | 9.154 | 13.731 |
| 2.142566189748245 | 4.591 | 9.181 | 13.772 |
| 2.145707782401834 | 4.604 | 9.208 | 13.812 |
| 2.148849375055424 | 4.618 | 9.235 | 13.853 |
| 2.151990967709013 | 4.631 | 9.262 | 13.893 |
| 2.155132560362603 | 4.645 | 9.289 | 13.934 |
| 2.158274153016193 | 4.658 | 9.316 | 13.974 |
| 2.161415745669782 | 4.672 | 9.343 | 14.015 |
| 2.164557338323372 | 4.685 | 9.371 | 14.056 |
| 2.167698930976961 | 4.699 | 9.398 | 14.097 |
| 2.170840523630551 | 4.713 | 9.425 | 14.138 |
| 2.173982116284141 | 4.726 | 9.452 | 14.179 |
| 2.17712370893773 | 4.74 | 9.48 | 14.22 |
| 2.18026530159132 | 4.754 | 9.507 | 14.261 |
| 2.183406894244909 | 4.767 | 9.535 | 14.302 |
| 2.186548486898499 | 4.781 | 9.562 | 14.343 |
| 2.189690079552089 | 4.795 | 9.589 | 14.384 |
| 2.192831672205678 | 4.809 | 9.617 | 14.426 |
| 2.195973264859268 | 4.822 | 9.645 | 14.467 |
| 2.199114857512857 | 4.836 | 9.672 | 14.508 |
| 2.202256450166447 | 4.85 | 9.7 | 14.55 |
| 2.205398042820036 | 4.864 | 9.728 | 14.591 |
| 2.208539635473626 | 4.878 | 9.755 | 14.633 |
| 2.211681228127216 | 4.892 | 9.783 | 14.675 |
| 2.214822820780805 | 4.905 | 9.811 | 14.716 |
| 2.217964413434395 | 4.919 | 9.839 | 14.758 |
| 2.221106006087984 | 4.933 | 9.867 | 14.8 |
| 2.224247598741574 | 4.947 | 9.895 | 14.842 |
| 2.227389191395164 | 4.961 | 9.923 | 14.884 |
| 2.230530784048753 | 4.975 | 9.951 | 14.926 |
| 2.233672376702343 | 4.989 | 9.979 | 14.968 |
| 2.236813969355933 | 5.003 | 10.007 | 15.01 |
| 2.239955562009522 | 5.017 | 10.035 | 15.052 |
| 2.243097154663112 | 5.031 | 10.063 | 15.094 |
| 2.246238747316701 | 5.046 | 10.091 | 15.137 |
| 2.249380339970291 | 5.06 | 10.119 | 15.179 |
| 2.252521932623881 | 5.074 | 10.148 | 15.222 |
| 2.25566352527747 | 5.088 | 10.176 | 15.264 |
| 2.25880511793106 | 5.102 | 10.204 | 15.307 |
| 2.261946710584649 | 5.116 | 10.233 | 15.349 |
| 2.265088303238239 | 5.131 | 10.261 | 15.392 |
| 2.268229895891829 | 5.145 | 10.29 | 15.435 |
| 2.271371488545418 | 5.159 | 10.318 | 15.477 |
| 2.274513081199008 | 5.173 | 10.347 | 15.52 |
| 2.277654673852597 | 5.188 | 10.375 | 15.563 |
| 2.280796266506186 | 5.202 | 10.404 | 15.606 |
| 2.283937859159776 | 5.216 | 10.433 | 15.649 |
| 2.287079451813366 | 5.231 | 10.461 | 15.692 |
| 2.290221044466955 | 5.245 | 10.49 | 15.735 |
| 2.293362637120545 | 5.26 | 10.519 | 15.779 |
| 2.296504229774135 | 5.274 | 10.548 | 15.822 |
| 2.299645822427724 | 5.288 | 10.577 | 15.865 |
| 2.302787415081314 | 5.303 | 10.606 | 15.908 |
| 2.305929007734904 | 5.317 | 10.635 | 15.952 |
| 2.309070600388493 | 5.332 | 10.664 | 15.995 |
| 2.312212193042083 | 5.346 | 10.693 | 16.039 |
| 2.315353785695672 | 5.361 | 10.722 | 16.083 |
| 2.318495378349262 | 5.375 | 10.751 | 16.126 |
| 2.321636971002852 | 5.39 | 10.78 | 16.17 |
| 2.324778563656441 | 5.405 | 10.809 | 16.214 |
| 2.327920156310031 | 5.419 | 10.838 | 16.258 |
| 2.33106174896362 | 5.434 | 10.868 | 16.302 |
| 2.33420334161721 | 5.449 | 10.897 | 16.346 |
| 2.3373449342708 | 5.463 | 10.926 | 16.39 |
| 2.340486526924389 | 5.478 | 10.956 | 16.434 |
| 2.343628119577979 | 5.493 | 10.985 | 16.478 |
| 2.346769712231568 | 5.507 | 11.015 | 16.522 |
| 2.349911304885158 | 5.522 | 11.044 | 16.566 |
| 2.353052897538748 | 5.537 | 11.074 | 16.611 |
| 2.356194490192337 | 5.552 | 11.103 | 16.655 |
| 2.359336082845927 | 5.566 | 11.133 | 16.699 |
| 2.362477675499516 | 5.581 | 11.163 | 16.744 |
| 2.365619268153106 | 5.596 | 11.192 | 16.788 |
| 2.368760860806696 | 5.611 | 11.222 | 16.833 |
| 2.371902453460285 | 5.626 | 11.252 | 16.878 |
| 2.375044046113875 | 5.641 | 11.282 | 16.923 |
| 2.378185638767464 | 5.656 | 11.312 | 16.967 |
| 2.381327231421054 | 5.671 | 11.341 | 17.012 |
| 2.384468824074644 | 5.686 | 11.371 | 17.057 |
| 2.387610416728233 | 5.701 | 11.401 | 17.102 |
| 2.390752009381823 | 5.716 | 11.431 | 17.147 |
| 2.393893602035412 | 5.731 | 11.461 | 17.192 |
| 2.397035194689002 | 5.746 | 11.492 | 17.237 |
| 2.400176787342591 | 5.761 | 11.522 | 17.283 |
| 2.403318379996181 | 5.776 | 11.552 | 17.328 |
| 2.406459972649771 | 5.791 | 11.582 | 17.373 |
| 2.40960156530336 | 5.806 | 11.612 | 17.419 |
| 2.41274315795695 | 5.821 | 11.643 | 17.464 |
| 2.41588475061054 | 5.836 | 11.673 | 17.509 |
| 2.419026343264129 | 5.852 | 11.703 | 17.555 |
| 2.422167935917719 | 5.867 | 11.734 | 17.601 |
| 2.425309528571308 | 5.882 | 11.764 | 17.646 |
| 2.428451121224898 | 5.897 | 11.795 | 17.692 |
| 2.431592713878488 | 5.913 | 11.825 | 17.738 |
| 2.434734306532077 | 5.928 | 11.856 | 17.784 |
| 2.437875899185667 | 5.943 | 11.886 | 17.83 |
| 2.441017491839256 | 5.959 | 11.917 | 17.876 |
| 2.444159084492846 | 5.974 | 11.948 | 17.922 |
| 2.447300677146435 | 5.989 | 11.979 | 17.968 |
| 2.450442269800025 | 6.005 | 12.009 | 18.014 |
| 2.453583862453615 | 6.02 | 12.04 | 18.06 |
| 2.456725455107204 | 6.035 | 12.071 | 18.106 |
| 2.459867047760794 | 6.051 | 12.102 | 18.153 |
| 2.463008640414384 | 6.066 | 12.133 | 18.199 |
| 2.466150233067973 | 6.082 | 12.164 | 18.246 |
| 2.469291825721563 | 6.097 | 12.195 | 18.292 |
| 2.472433418375152 | 6.113 | 12.226 | 18.339 |
| 2.475575011028742 | 6.128 | 12.257 | 18.385 |
| 2.478716603682332 | 6.144 | 12.288 | 18.432 |
| 2.481858196335921 | 6.16 | 12.319 | 18.479 |
| 2.48499978898951 | 6.175 | 12.35 | 18.526 |
| 2.4881413816431 | 6.191 | 12.382 | 18.573 |
| 2.49128297429669 | 6.206 | 12.413 | 18.619 |
| 2.49442456695028 | 6.222 | 12.444 | 18.666 |
| 2.497566159603869 | 6.238 | 12.476 | 18.714 |
| 2.500707752257458 | 6.254 | 12.507 | 18.761 |
| 2.503849344911048 | 6.269 | 12.539 | 18.808 |
| 2.506990937564638 | 6.285 | 12.57 | 18.855 |
| 2.510132530218228 | 6.301 | 12.602 | 18.902 |
| 2.513274122871817 | 6.317 | 12.633 | 18.95 |
| 2.516415715525407 | 6.332 | 12.665 | 18.997 |
| 2.519557308178996 | 6.348 | 12.696 | 19.045 |
| 2.522698900832586 | 6.364 | 12.728 | 19.092 |
| 2.525840493486176 | 6.38 | 12.76 | 19.14 |
| 2.528982086139765 | 6.396 | 12.792 | 19.187 |
| 2.532123678793355 | 6.412 | 12.823 | 19.235 |
| 2.535265271446944 | 6.428 | 12.855 | 19.283 |
| 2.538406864100534 | 6.444 | 12.887 | 19.331 |
| 2.541548456754124 | 6.459 | 12.919 | 19.378 |
| 2.544690049407713 | 6.475 | 12.951 | 19.426 |
| 2.547831642061302 | 6.491 | 12.983 | 19.474 |
| 2.550973234714892 | 6.507 | 13.015 | 19.522 |
| 2.554114827368482 | 6.524 | 13.047 | 19.571 |
| 2.557256420022072 | 6.54 | 13.079 | 19.619 |
| 2.560398012675661 | 6.556 | 13.111 | 19.667 |
| 2.563539605329251 | 6.572 | 13.143 | 19.715 |
| 2.56668119798284 | 6.588 | 13.176 | 19.764 |
| 2.56982279063643 | 6.604 | 13.208 | 19.812 |
| 2.57296438329002 | 6.62 | 13.24 | 19.86 |
| 2.576105975943609 | 6.636 | 13.273 | 19.909 |
| 2.579247568597199 | 6.653 | 13.305 | 19.958 |
| 2.582389161250788 | 6.669 | 13.337 | 20.006 |
| 2.585530753904377 | 6.685 | 13.37 | 20.055 |
| 2.588672346557967 | 6.701 | 13.402 | 20.104 |
| 2.591813939211557 | 6.717 | 13.435 | 20.152 |
| 2.594955531865147 | 6.734 | 13.468 | 20.201 |
| 2.598097124518736 | 6.75 | 13.5 | 20.25 |
| 2.601238717172326 | 6.766 | 13.533 | 20.299 |
| 2.604380309825915 | 6.783 | 13.566 | 20.348 |
| 2.607521902479505 | 6.799 | 13.598 | 20.398 |
| 2.610663495133095 | 6.816 | 13.631 | 20.447 |
| 2.613805087786684 | 6.832 | 13.664 | 20.496 |
| 2.616946680440274 | 6.848 | 13.697 | 20.545 |
| 2.620088273093863 | 6.865 | 13.73 | 20.595 |
| 2.623229865747452 | 6.881 | 13.763 | 20.644 |
| 2.626371458401042 | 6.898 | 13.796 | 20.693 |
| 2.629513051054632 | 6.914 | 13.829 | 20.743 |
| 2.632654643708222 | 6.931 | 13.862 | 20.793 |
| 2.635796236361811 | 6.947 | 13.895 | 20.842 |
| 2.638937829015401 | 6.964 | 13.928 | 20.892 |
| 2.642079421668991 | 6.981 | 13.961 | 20.942 |
| 2.64522101432258 | 6.997 | 13.994 | 20.992 |
| 2.64836260697617 | 7.014 | 14.028 | 21.041 |
| 2.651504199629759 | 7.03 | 14.061 | 21.091 |
| 2.654645792283349 | 7.047 | 14.094 | 21.141 |
| 2.657787384936938 | 7.064 | 14.128 | 21.192 |
| 2.660928977590528 | 7.081 | 14.161 | 21.242 |
| 2.664070570244118 | 7.097 | 14.195 | 21.292 |
| 2.667212162897707 | 7.114 | 14.228 | 21.342 |
| 2.670353755551297 | 7.131 | 14.262 | 21.392 |
| 2.673495348204887 | 7.148 | 14.295 | 21.443 |
| 2.676636940858476 | 7.164 | 14.329 | 21.493 |
| 2.679778533512066 | 7.181 | 14.362 | 21.544 |
| 2.682920126165655 | 7.198 | 14.396 | 21.594 |
| 2.686061718819245 | 7.215 | 14.43 | 21.645 |
| 2.689203311472835 | 7.232 | 14.464 | 21.695 |
| 2.692344904126424 | 7.249 | 14.497 | 21.746 |
| 2.695486496780014 | 7.266 | 14.531 | 21.797 |
| 2.698628089433603 | 7.283 | 14.565 | 21.848 |
| 2.701769682087193 | 7.3 | 14.599 | 21.899 |
| 2.704911274740782 | 7.317 | 14.633 | 21.95 |
| 2.708052867394372 | 7.334 | 14.667 | 22.001 |
| 2.711194460047962 | 7.351 | 14.701 | 22.052 |
| 2.714336052701551 | 7.368 | 14.735 | 22.103 |
| 2.717477645355141 | 7.385 | 14.769 | 22.154 |
| 2.720619238008731 | 7.402 | 14.804 | 22.205 |
| 2.72376083066232 | 7.419 | 14.838 | 22.257 |
| 2.72690242331591 | 7.436 | 14.872 | 22.308 |
| 2.730044015969499 | 7.453 | 14.906 | 22.359 |
| 2.733185608623089 | 7.47 | 14.941 | 22.411 |
| 2.736327201276678 | 7.487 | 14.975 | 22.462 |
| 2.739468793930268 | 7.505 | 15.009 | 22.514 |
| 2.742610386583858 | 7.522 | 15.044 | 22.566 |
| 2.745751979237447 | 7.539 | 15.078 | 22.617 |
| 2.748893571891036 | 7.556 | 15.113 | 22.669 |
| 2.752035164544627 | 7.574 | 15.147 | 22.721 |
| 2.755176757198216 | 7.591 | 15.182 | 22.773 |
| 2.758318349851806 | 7.608 | 15.217 | 22.825 |
| 2.761459942505395 | 7.626 | 15.251 | 22.877 |
| 2.764601535158985 | 7.643 | 15.286 | 22.929 |
| 2.767743127812574 | 7.66 | 15.321 | 22.981 |
| 2.770884720466164 | 7.678 | 15.356 | 23.033 |
| 2.774026313119754 | 7.695 | 15.39 | 23.086 |
| 2.777167905773343 | 7.713 | 15.425 | 23.138 |
| 2.780309498426932 | 7.73 | 15.46 | 23.19 |
| 2.783451091080522 | 7.748 | 15.495 | 23.243 |
| 2.786592683734112 | 7.765 | 15.53 | 23.295 |
| 2.789734276387701 | 7.783 | 15.565 | 23.348 |
| 2.792875869041291 | 7.8 | 15.6 | 23.4 |
| 2.796017461694881 | 7.818 | 15.635 | 23.453 |
| 2.79915905434847 | 7.835 | 15.671 | 23.506 |
| 2.80230064700206 | 7.853 | 15.706 | 23.559 |
| 2.80544223965565 | 7.871 | 15.741 | 23.612 |
| 2.808583832309239 | 7.888 | 15.776 | 23.664 |
| 2.811725424962829 | 7.906 | 15.812 | 23.717 |
| 2.814867017616419 | 7.923 | 15.847 | 23.77 |
| 2.818008610270008 | 7.941 | 15.882 | 23.824 |
| 2.821150202923598 | 7.959 | 15.918 | 23.877 |
| 2.824291795577187 | 7.977 | 15.953 | 23.93 |
| 2.827433388230777 | 7.994 | 15.989 | 23.983 |
| 2.830574980884366 | 8.012 | 16.024 | 24.036 |
| 2.833716573537956 | 8.03 | 16.06 | 24.09 |
| 2.836858166191546 | 8.048 | 16.096 | 24.143 |
| 2.839999758845135 | 8.066 | 16.131 | 24.197 |
| 2.843141351498725 | 8.083 | 16.167 | 24.25 |
| 2.846282944152314 | 8.101 | 16.203 | 24.304 |
| 2.849424536805904 | 8.119 | 16.238 | 24.358 |
| 2.852566129459494 | 8.137 | 16.274 | 24.411 |
| 2.855707722113083 | 8.155 | 16.31 | 24.465 |
| 2.858849314766673 | 8.173 | 16.346 | 24.519 |
| 2.861990907420262 | 8.191 | 16.382 | 24.573 |
| 2.865132500073852 | 8.209 | 16.418 | 24.627 |
| 2.868274092727442 | 8.227 | 16.454 | 24.681 |
| 2.871415685381031 | 8.245 | 16.49 | 24.735 |
| 2.874557278034621 | 8.263 | 16.526 | 24.789 |
| 2.87769887068821 | 8.281 | 16.562 | 24.843 |
| 2.8808404633418 | 8.299 | 16.598 | 24.898 |
| 2.88398205599539 | 8.317 | 16.635 | 24.952 |
| 2.88712364864898 | 8.335 | 16.671 | 25.006 |
| 2.890265241302569 | 8.354 | 16.707 | 25.061 |
| 2.893406833956158 | 8.372 | 16.744 | 25.115 |
| 2.896548426609748 | 8.39 | 16.78 | 25.17 |
| 2.899690019263338 | 8.408 | 16.816 | 25.225 |
| 2.902831611916927 | 8.426 | 16.853 | 25.279 |
| 2.905973204570517 | 8.445 | 16.889 | 25.334 |
| 2.909114797224106 | 8.463 | 16.926 | 25.389 |
| 2.912256389877696 | 8.481 | 16.962 | 25.444 |
| 2.915397982531286 | 8.5 | 16.999 | 25.499 |
| 2.918539575184875 | 8.518 | 17.036 | 25.554 |
| 2.921681167838465 | 8.536 | 17.072 | 25.609 |
| 2.924822760492054 | 8.555 | 17.109 | 25.664 |
| 2.927964353145644 | 8.573 | 17.146 | 25.719 |
| 2.931105945799234 | 8.591 | 17.183 | 25.774 |
| 2.934247538452823 | 8.61 | 17.22 | 25.829 |
| 2.937389131106413 | 8.628 | 17.257 | 25.885 |
| 2.940530723760002 | 8.647 | 17.293 | 25.94 |
| 2.943672316413592 | 8.665 | 17.33 | 25.996 |
| 2.946813909067182 | 8.684 | 17.367 | 26.051 |
| 2.949955501720771 | 8.702 | 17.404 | 26.107 |
| 2.953097094374361 | 8.721 | 17.442 | 26.162 |
| 2.95623868702795 | 8.739 | 17.479 | 26.218 |
| 2.95938027968154 | 8.758 | 17.516 | 26.274 |
| 2.96252187233513 | 8.777 | 17.553 | 26.33 |
| 2.965663464988719 | 8.795 | 17.59 | 26.385 |
| 2.968805057642309 | 8.814 | 17.628 | 26.441 |
| 2.971946650295898 | 8.832 | 17.665 | 26.497 |
| 2.975088242949488 | 8.851 | 17.702 | 26.553 |
| 2.978229835603078 | 8.87 | 17.74 | 26.61 |
| 2.981371428256667 | 8.889 | 17.777 | 26.666 |
| 2.984513020910257 | 8.907 | 17.815 | 26.722 |
| 2.987654613563846 | 8.926 | 17.852 | 26.778 |
| 2.990796206217436 | 8.945 | 17.89 | 26.835 |
| 2.993937798871025 | 8.964 | 17.927 | 26.891 |
| 2.997079391524615 | 8.982 | 17.965 | 26.947 |
| 3.000220984178205 | 9.001 | 18.003 | 27.004 |
| 3.003362576831794 | 9.02 | 18.04 | 27.061 |
| 3.006504169485384 | 9.039 | 18.078 | 27.117 |
| 3.009645762138974 | 9.058 | 18.116 | 27.174 |
| 3.012787354792563 | 9.077 | 18.154 | 27.231 |
| 3.015928947446153 | 9.096 | 18.192 | 27.287 |
| 3.019070540099742 | 9.115 | 18.23 | 27.344 |
| 3.022212132753332 | 9.134 | 18.268 | 27.401 |
| 3.025353725406922 | 9.153 | 18.306 | 27.458 |
| 3.028495318060511 | 9.172 | 18.344 | 27.515 |
| 3.031636910714101 | 9.191 | 18.382 | 27.572 |
| 3.03477850336769 | 9.21 | 18.42 | 27.63 |
| 3.03792009602128 | 9.229 | 18.458 | 27.687 |
| 3.04106168867487 | 9.248 | 18.496 | 27.744 |
| 3.04420328132846 | 9.267 | 18.534 | 27.802 |
| 3.047344873982049 | 9.286 | 18.573 | 27.859 |
| 3.050486466635638 | 9.305 | 18.611 | 27.916 |
| 3.053628059289228 | 9.325 | 18.649 | 27.974 |
| 3.056769651942818 | 9.344 | 18.688 | 28.032 |
| 3.059911244596407 | 9.363 | 18.726 | 28.089 |
| 3.063052837249997 | 9.382 | 18.765 | 28.147 |
| 3.066194429903586 | 9.402 | 18.803 | 28.205 |
| 3.069336022557176 | 9.421 | 18.842 | 28.262 |
| 3.072477615210766 | 9.44 | 18.88 | 28.32 |
| 3.075619207864355 | 9.459 | 18.919 | 28.378 |
| 3.078760800517945 | 9.479 | 18.958 | 28.436 |
| 3.081902393171534 | 9.498 | 18.996 | 28.494 |
| 3.085043985825124 | 9.517 | 19.035 | 28.552 |
| 3.088185578478713 | 9.537 | 19.074 | 28.611 |
| 3.091327171132303 | 9.556 | 19.113 | 28.669 |
| 3.094468763785893 | 9.576 | 19.151 | 28.727 |
| 3.097610356439482 | 9.595 | 19.19 | 28.786 |
| 3.100751949093072 | 9.615 | 19.229 | 28.844 |
| 3.103893541746661 | 9.634 | 19.268 | 28.902 |
| 3.107035134400251 | 9.654 | 19.307 | 28.961 |
| 3.110176727053841 | 9.673 | 19.346 | 29.02 |
| 3.11331831970743 | 9.693 | 19.386 | 29.078 |
| 3.11645991236102 | 9.712 | 19.425 | 29.137 |
| 3.11960150501461 | 9.732 | 19.464 | 29.196 |
| 3.122743097668199 | 9.752 | 19.503 | 29.255 |
| 3.125884690321789 | 9.771 | 19.542 | 29.313 |
| 3.129026282975378 | 9.791 | 19.582 | 29.372 |
| 3.132167875628968 | 9.81 | 19.621 | 29.431 |
| 3.135309468282557 | 9.83 | 19.66 | 29.49 |
| 3.138451060936147 | 9.85 | 19.7 | 29.55 |
| 3.141592653589737 | 9.87 | 19.739 | 29.609 |
| 3.144734246243326 | 9.889 | 19.779 | 29.668 |
| 3.147875838896916 | 9.909 | 19.818 | 29.727 |
| 3.151017431550505 | 9.929 | 19.858 | 29.787 |
| 3.154159024204095 | 9.949 | 19.897 | 29.846 |
| 3.157300616857685 | 9.969 | 19.937 | 29.906 |
| 3.160442209511274 | 9.988 | 19.977 | 29.965 |
| 3.163583802164864 | 10.008 | 20.017 | 30.025 |
| 3.166725394818453 | 10.028 | 20.056 | 30.084 |
| 3.169866987472043 | 10.048 | 20.096 | 30.144 |
| 3.173008580125633 | 10.068 | 20.136 | 30.204 |
| 3.176150172779222 | 10.088 | 20.176 | 30.264 |
| 3.179291765432812 | 10.108 | 20.216 | 30.324 |
| 3.182433358086401 | 10.128 | 20.256 | 30.384 |
| 3.185574950739991 | 10.148 | 20.296 | 30.444 |
| 3.188716543393581 | 10.168 | 20.336 | 30.504 |
| 3.19185813604717 | 10.188 | 20.376 | 30.564 |
| 3.19499972870076 | 10.208 | 20.416 | 30.624 |
| 3.198141321354349 | 10.228 | 20.456 | 30.684 |
| 3.20128291400794 | 10.248 | 20.496 | 30.745 |
| 3.204424506661528 | 10.268 | 20.537 | 30.805 |
| 3.207566099315118 | 10.288 | 20.577 | 30.865 |
| 3.210707691968708 | 10.309 | 20.617 | 30.926 |
| 3.213849284622297 | 10.329 | 20.658 | 30.986 |
| 3.216990877275887 | 10.349 | 20.698 | 31.047 |
| 3.220132469929476 | 10.369 | 20.739 | 31.108 |
| 3.223274062583066 | 10.389 | 20.779 | 31.168 |
| 3.226415655236656 | 10.41 | 20.82 | 31.229 |
| 3.229557247890245 | 10.43 | 20.86 | 31.29 |
| 3.232698840543835 | 10.45 | 20.901 | 31.351 |
| 3.235840433197425 | 10.471 | 20.941 | 31.412 |
| 3.238982025851014 | 10.491 | 20.982 | 31.473 |
| 3.242123618504604 | 10.511 | 21.023 | 31.534 |
| 3.245265211158193 | 10.532 | 21.063 | 31.595 |
| 3.248406803811783 | 10.552 | 21.104 | 31.656 |
| 3.251548396465373 | 10.573 | 21.145 | 31.718 |
| 3.254689989118962 | 10.593 | 21.186 | 31.779 |
| 3.257831581772551 | 10.613 | 21.227 | 31.84 |
| 3.260973174426141 | 10.634 | 21.268 | 31.902 |
| 3.26411476707973 | 10.654 | 21.309 | 31.963 |
| 3.267256359733321 | 10.675 | 21.35 | 32.025 |
| 3.27039795238691 | 10.696 | 21.391 | 32.087 |
| 3.2735395450405 | 10.716 | 21.432 | 32.148 |
| 3.276681137694089 | 10.737 | 21.473 | 32.21 |
| 3.279822730347679 | 10.757 | 21.514 | 32.272 |
| 3.282964323001269 | 10.778 | 21.556 | 32.334 |
| 3.286105915654858 | 10.798 | 21.597 | 32.395 |
| 3.289247508308448 | 10.819 | 21.638 | 32.457 |
| 3.292389100962037 | 10.84 | 21.68 | 32.519 |
| 3.295530693615627 | 10.861 | 21.721 | 32.582 |
| 3.298672286269217 | 10.881 | 21.762 | 32.644 |
| 3.301813878922806 | 10.902 | 21.804 | 32.706 |
| 3.304955471576396 | 10.923 | 21.845 | 32.768 |
| 3.308097064229985 | 10.944 | 21.887 | 32.831 |
| 3.311238656883575 | 10.964 | 21.929 | 32.893 |
| 3.314380249537165 | 10.985 | 21.97 | 32.955 |
| 3.317521842190754 | 11.006 | 22.012 | 33.018 |
| 3.320663434844344 | 11.027 | 22.054 | 33.08 |
| 3.323805027497933 | 11.048 | 22.095 | 33.143 |
| 3.326946620151523 | 11.069 | 22.137 | 33.206 |
| 3.330088212805113 | 11.089 | 22.179 | 33.268 |
| 3.333229805458702 | 11.11 | 22.221 | 33.331 |
| 3.336371398112292 | 11.131 | 22.263 | 33.394 |
| 3.339512990765881 | 11.152 | 22.305 | 33.457 |
| 3.342654583419471 | 11.173 | 22.347 | 33.52 |
| 3.345796176073061 | 11.194 | 22.389 | 33.583 |
| 3.34893776872665 | 11.215 | 22.431 | 33.646 |
| 3.35207936138024 | 11.236 | 22.473 | 33.709 |
| 3.355220954033829 | 11.258 | 22.515 | 33.773 |
| 3.358362546687419 | 11.279 | 22.557 | 33.836 |
| 3.361504139341009 | 11.3 | 22.599 | 33.899 |
| 3.364645731994598 | 11.321 | 22.642 | 33.963 |
| 3.367787324648188 | 11.342 | 22.684 | 34.026 |
| 3.370928917301777 | 11.363 | 22.726 | 34.089 |
| 3.374070509955367 | 11.384 | 22.769 | 34.153 |
| 3.377212102608956 | 11.406 | 22.811 | 34.217 |
| 3.380353695262546 | 11.427 | 22.854 | 34.28 |
| 3.383495287916136 | 11.448 | 22.896 | 34.344 |
| 3.386636880569725 | 11.469 | 22.939 | 34.408 |
| 3.389778473223315 | 11.491 | 22.981 | 34.472 |
| 3.392920065876904 | 11.512 | 23.024 | 34.536 |
| 3.396061658530494 | 11.533 | 23.066 | 34.6 |
| 3.399203251184084 | 11.555 | 23.109 | 34.664 |
| 3.402344843837673 | 11.576 | 23.152 | 34.728 |
| 3.405486436491263 | 11.597 | 23.195 | 34.792 |
| 3.408628029144852 | 11.619 | 23.237 | 34.856 |
| 3.411769621798442 | 11.64 | 23.28 | 34.921 |
| 3.414911214452032 | 11.662 | 23.323 | 34.985 |
| 3.418052807105621 | 11.683 | 23.366 | 35.049 |
| 3.421194399759211 | 11.705 | 23.409 | 35.114 |
| 3.4243359924128 | 11.726 | 23.452 | 35.178 |
| 3.42747758506639 | 11.748 | 23.495 | 35.243 |
| 3.43061917771998 | 11.769 | 23.538 | 35.307 |
| 3.433760770373569 | 11.791 | 23.581 | 35.372 |
| 3.436902363027159 | 11.812 | 23.625 | 35.437 |
| 3.440043955680748 | 11.834 | 23.668 | 35.502 |
| 3.443185548334338 | 11.856 | 23.711 | 35.567 |
| 3.446327140987927 | 11.877 | 23.754 | 35.632 |
| 3.449468733641517 | 11.899 | 23.798 | 35.697 |
| 3.452610326295107 | 11.921 | 23.841 | 35.762 |
| 3.455751918948696 | 11.942 | 23.884 | 35.827 |
| 3.458893511602286 | 11.964 | 23.928 | 35.892 |
| 3.462035104255876 | 11.986 | 23.971 | 35.957 |
| 3.465176696909465 | 12.007 | 24.015 | 36.022 |
| 3.468318289563055 | 12.029 | 24.058 | 36.088 |
| 3.471459882216644 | 12.051 | 24.102 | 36.153 |
| 3.474601474870234 | 12.073 | 24.146 | 36.219 |
| 3.477743067523824 | 12.095 | 24.189 | 36.284 |
| 3.480884660177413 | 12.117 | 24.233 | 36.35 |
| 3.484026252831002 | 12.138 | 24.277 | 36.415 |
| 3.487167845484592 | 12.16 | 24.321 | 36.481 |
| 3.490309438138182 | 12.182 | 24.365 | 36.547 |
| 3.493451030791772 | 12.204 | 24.408 | 36.613 |
| 3.496592623445361 | 12.226 | 24.452 | 36.678 |
| 3.499734216098951 | 12.248 | 24.496 | 36.744 |
| 3.50287580875254 | 12.27 | 24.54 | 36.81 |
| 3.50601740140613 | 12.292 | 24.584 | 36.876 |
| 3.50915899405972 | 12.314 | 24.628 | 36.943 |
| 3.512300586713309 | 12.336 | 24.673 | 37.009 |
| 3.515442179366899 | 12.358 | 24.717 | 37.075 |
| 3.518583772020488 | 12.38 | 24.761 | 37.141 |
| 3.521725364674078 | 12.403 | 24.805 | 37.208 |
| 3.524866957327668 | 12.425 | 24.849 | 37.274 |
| 3.528008549981257 | 12.447 | 24.894 | 37.341 |
| 3.531150142634847 | 12.469 | 24.938 | 37.407 |
| 3.534291735288436 | 12.491 | 24.982 | 37.474 |
| 3.537433327942026 | 12.513 | 25.027 | 37.54 |
| 3.540574920595616 | 12.536 | 25.071 | 37.607 |
| 3.543716513249205 | 12.558 | 25.116 | 37.674 |
| 3.546858105902795 | 12.58 | 25.16 | 37.741 |
| 3.549999698556384 | 12.602 | 25.205 | 37.807 |
| 3.553141291209974 | 12.625 | 25.25 | 37.874 |
| 3.556282883863564 | 12.647 | 25.294 | 37.941 |
| 3.559424476517153 | 12.67 | 25.339 | 38.009 |
| 3.562566069170743 | 12.692 | 25.384 | 38.076 |
| 3.565707661824332 | 12.714 | 25.429 | 38.143 |
| 3.568849254477922 | 12.737 | 25.473 | 38.21 |
| 3.571990847131511 | 12.759 | 25.518 | 38.277 |
| 3.575132439785101 | 12.782 | 25.563 | 38.345 |
| 3.578274032438691 | 12.804 | 25.608 | 38.412 |
| 3.58141562509228 | 12.827 | 25.653 | 38.48 |
| 3.58455721774587 | 12.849 | 25.698 | 38.547 |
| 3.58769881039946 | 12.872 | 25.743 | 38.615 |
| 3.590840403053049 | 12.894 | 25.788 | 38.682 |
| 3.593981995706639 | 12.917 | 25.833 | 38.75 |
| 3.597123588360228 | 12.939 | 25.879 | 38.818 |
| 3.600265181013818 | 12.962 | 25.924 | 38.886 |
| 3.603406773667407 | 12.985 | 25.969 | 38.954 |
| 3.606548366320997 | 13.007 | 26.014 | 39.022 |
| 3.609689958974587 | 13.03 | 26.06 | 39.09 |
| 3.612831551628176 | 13.053 | 26.105 | 39.158 |
| 3.615973144281766 | 13.075 | 26.151 | 39.226 |
| 3.619114736935355 | 13.098 | 26.196 | 39.294 |
| 3.622256329588945 | 13.121 | 26.241 | 39.362 |
| 3.625397922242534 | 13.144 | 26.287 | 39.431 |
| 3.628539514896124 | 13.166 | 26.333 | 39.499 |
| 3.631681107549714 | 13.189 | 26.378 | 39.567 |
| 3.634822700203303 | 13.212 | 26.424 | 39.636 |
| 3.637964292856893 | 13.235 | 26.47 | 39.704 |
| 3.641105885510483 | 13.258 | 26.515 | 39.773 |
| 3.644247478164072 | 13.281 | 26.561 | 39.842 |
| 3.647389070817662 | 13.303 | 26.607 | 39.91 |
| 3.650530663471251 | 13.326 | 26.653 | 39.979 |
| 3.653672256124841 | 13.349 | 26.699 | 40.048 |
| 3.656813848778431 | 13.372 | 26.745 | 40.117 |
| 3.65995544143202 | 13.395 | 26.791 | 40.186 |
| 3.66309703408561 | 13.418 | 26.837 | 40.255 |
| 3.666238626739199 | 13.441 | 26.883 | 40.324 |
| 3.66938021939279 | 13.464 | 26.929 | 40.393 |
| 3.672521812046378 | 13.487 | 26.975 | 40.462 |
| 3.675663404699968 | 13.511 | 27.021 | 40.532 |
| 3.678804997353558 | 13.534 | 27.067 | 40.601 |
| 3.681946590007147 | 13.557 | 27.113 | 40.67 |
| 3.685088182660737 | 13.58 | 27.16 | 40.74 |
| 3.688229775314326 | 13.603 | 27.206 | 40.809 |
| 3.691371367967916 | 13.626 | 27.252 | 40.879 |
| 3.694512960621506 | 13.649 | 27.299 | 40.948 |
| 3.697654553275095 | 13.673 | 27.345 | 41.018 |
| 3.700796145928685 | 13.696 | 27.392 | 41.088 |
| 3.703937738582274 | 13.719 | 27.438 | 41.157 |
| 3.707079331235864 | 13.742 | 27.485 | 41.227 |
| 3.710220923889454 | 13.766 | 27.531 | 41.297 |
| 3.713362516543043 | 13.789 | 27.578 | 41.367 |
| 3.716504109196633 | 13.812 | 27.625 | 41.437 |
| 3.719645701850223 | 13.836 | 27.672 | 41.507 |
| 3.722787294503812 | 13.859 | 27.718 | 41.577 |
| 3.725928887157402 | 13.883 | 27.765 | 41.648 |
| 3.729070479810991 | 13.906 | 27.812 | 41.718 |
| 3.732212072464581 | 13.929 | 27.859 | 41.788 |
| 3.735353665118171 | 13.953 | 27.906 | 41.859 |
| 3.73849525777176 | 13.976 | 27.953 | 41.929 |
| 3.74163685042535 | 14 | 28 | 42 |
| 3.744778443078939 | 14.023 | 28.047 | 42.07 |
| 3.747920035732529 | 14.047 | 28.094 | 42.141 |
| 3.751061628386119 | 14.07 | 28.141 | 42.211 |
| 3.754203221039708 | 14.094 | 28.188 | 42.282 |
| 3.757344813693298 | 14.118 | 28.235 | 42.353 |
| 3.760486406346887 | 14.141 | 28.283 | 42.424 |
| 3.763627999000477 | 14.165 | 28.33 | 42.495 |
| 3.766769591654067 | 14.189 | 28.377 | 42.566 |
| 3.769911184307656 | 14.212 | 28.424 | 42.637 |
| 3.773052776961246 | 14.236 | 28.472 | 42.708 |
| 3.776194369614835 | 14.26 | 28.519 | 42.779 |
| 3.779335962268425 | 14.283 | 28.567 | 42.85 |
| 3.782477554922014 | 14.307 | 28.614 | 42.921 |
| 3.785619147575604 | 14.331 | 28.662 | 42.993 |
| 3.788760740229193 | 14.355 | 28.709 | 43.064 |
| 3.791902332882783 | 14.379 | 28.757 | 43.136 |
| 3.795043925536373 | 14.402 | 28.805 | 43.207 |
| 3.798185518189962 | 14.426 | 28.852 | 43.279 |
| 3.801327110843552 | 14.45 | 28.9 | 43.35 |
| 3.804468703497142 | 14.474 | 28.948 | 43.422 |
| 3.807610296150731 | 14.498 | 28.996 | 43.494 |
| 3.810751888804321 | 14.522 | 29.044 | 43.565 |
| 3.813893481457911 | 14.546 | 29.092 | 43.637 |
| 3.8170350741115 | 14.57 | 29.14 | 43.709 |
| 3.82017666676509 | 14.594 | 29.187 | 43.781 |
| 3.823318259418679 | 14.618 | 29.236 | 43.853 |
| 3.826459852072269 | 14.642 | 29.284 | 43.925 |
| 3.829601444725859 | 14.666 | 29.332 | 43.998 |
| 3.832743037379448 | 14.69 | 29.38 | 44.07 |
| 3.835884630033038 | 14.714 | 29.428 | 44.142 |
| 3.839026222686627 | 14.738 | 29.476 | 44.214 |
| 3.842167815340217 | 14.762 | 29.525 | 44.287 |
| 3.845309407993807 | 14.786 | 29.573 | 44.359 |
| 3.848451000647396 | 14.811 | 29.621 | 44.432 |
| 3.851592593300986 | 14.835 | 29.67 | 44.504 |
| 3.854734185954575 | 14.859 | 29.718 | 44.577 |
| 3.857875778608165 | 14.883 | 29.766 | 44.65 |
| 3.861017371261755 | 14.907 | 29.815 | 44.722 |
| 3.864158963915344 | 14.932 | 29.863 | 44.795 |
| 3.867300556568933 | 14.956 | 29.912 | 44.868 |
| 3.870442149222523 | 14.98 | 29.961 | 44.941 |
| 3.873583741876112 | 15.005 | 30.009 | 45.014 |
| 3.876725334529703 | 15.029 | 30.058 | 45.087 |
| 3.879866927183292 | 15.053 | 30.107 | 45.16 |
| 3.883008519836882 | 15.078 | 30.156 | 45.233 |
| 3.886150112490471 | 15.102 | 30.204 | 45.306 |
| 3.889291705144061 | 15.127 | 30.253 | 45.38 |
| 3.892433297797651 | 15.151 | 30.302 | 45.453 |
| 3.89557489045124 | 15.176 | 30.351 | 45.527 |
| 3.89871648310483 | 15.2 | 30.4 | 45.6 |
| 3.901858075758419 | 15.224 | 30.449 | 45.673 |
| 3.904999668412009 | 15.249 | 30.498 | 45.747 |
| 3.908141261065598 | 15.274 | 30.547 | 45.821 |
| 3.911282853719188 | 15.298 | 30.596 | 45.894 |
| 3.914424446372778 | 15.323 | 30.645 | 45.968 |
| 3.917566039026367 | 15.347 | 30.695 | 46.042 |
| 3.920707631679957 | 15.372 | 30.744 | 46.116 |
| 3.923849224333547 | 15.397 | 30.793 | 46.19 |
| 3.926990816987136 | 15.421 | 30.843 | 46.264 |
| 3.930132409640726 | 15.446 | 30.892 | 46.338 |
| 3.933274002294315 | 15.471 | 30.941 | 46.412 |
| 3.936415594947905 | 15.495 | 30.991 | 46.486 |
| 3.939557187601495 | 15.52 | 31.04 | 46.56 |
| 3.942698780255084 | 15.545 | 31.09 | 46.635 |
| 3.945840372908674 | 15.57 | 31.139 | 46.709 |
| 3.948981965562263 | 15.594 | 31.189 | 46.783 |
| 3.952123558215853 | 15.619 | 31.239 | 46.858 |
| 3.955265150869442 | 15.644 | 31.288 | 46.932 |
| 3.958406743523032 | 15.669 | 31.338 | 47.007 |
| 3.961548336176622 | 15.694 | 31.388 | 47.082 |
| 3.964689928830211 | 15.719 | 31.438 | 47.156 |
| 3.967831521483801 | 15.744 | 31.487 | 47.231 |
| 3.97097311413739 | 15.769 | 31.537 | 47.306 |
| 3.97411470679098 | 15.794 | 31.587 | 47.381 |
| 3.97725629944457 | 15.819 | 31.637 | 47.456 |
| 3.98039789209816 | 15.844 | 31.687 | 47.531 |
| 3.983539484751749 | 15.869 | 31.737 | 47.606 |
| 3.986681077405338 | 15.894 | 31.787 | 47.681 |
| 3.989822670058928 | 15.919 | 31.837 | 47.756 |
| 3.992964262712517 | 15.944 | 31.888 | 47.831 |
| 3.996105855366107 | 15.969 | 31.938 | 47.907 |
| 3.999247448019697 | 15.994 | 31.988 | 47.982 |
| 4.002389040673287 | 16.019 | 32.038 | 48.057 |
| 4.005530633326877 | 16.044 | 32.089 | 48.133 |
| 4.008672225980466 | 16.069 | 32.139 | 48.208 |
| 4.011813818634056 | 16.095 | 32.189 | 48.284 |
| 4.014955411287645 | 16.12 | 32.24 | 48.36 |
| 4.018097003941234 | 16.145 | 32.29 | 48.435 |
| 4.021238596594824 | 16.17 | 32.341 | 48.511 |
| 4.024380189248414 | 16.196 | 32.391 | 48.587 |
| 4.027521781902004 | 16.221 | 32.442 | 48.663 |
| 4.030663374555593 | 16.246 | 32.492 | 48.739 |
| 4.033804967209183 | 16.272 | 32.543 | 48.815 |
| 4.036946559862773 | 16.297 | 32.594 | 48.891 |
| 4.040088152516362 | 16.322 | 32.645 | 48.967 |
| 4.043229745169951 | 16.348 | 32.695 | 49.043 |
| 4.046371337823541 | 16.373 | 32.746 | 49.119 |
| 4.049512930477131 | 16.399 | 32.797 | 49.196 |
| 4.05265452313072 | 16.424 | 32.848 | 49.272 |
| 4.05579611578431 | 16.449 | 32.899 | 49.348 |
| 4.0589377084379 | 16.475 | 32.95 | 49.425 |
| 4.062079301091489 | 16.5 | 33.001 | 49.501 |
| 4.065220893745079 | 16.526 | 33.052 | 49.578 |
| 4.068362486398668 | 16.552 | 33.103 | 49.655 |
| 4.071504079052258 | 16.577 | 33.154 | 49.731 |
| 4.074645671705848 | 16.603 | 33.205 | 49.808 |
| 4.077787264359437 | 16.628 | 33.257 | 49.885 |
| 4.080928857013027 | 16.654 | 33.308 | 49.962 |
| 4.084070449666616 | 16.68 | 33.359 | 50.039 |
| 4.087212042320206 | 16.705 | 33.411 | 50.116 |
| 4.090353634973795 | 16.731 | 33.462 | 50.193 |
| 4.093495227627385 | 16.757 | 33.513 | 50.27 |
| 4.096636820280975 | 16.782 | 33.565 | 50.347 |
| 4.099778412934564 | 16.808 | 33.616 | 50.425 |
| 4.102920005588154 | 16.834 | 33.668 | 50.502 |
| 4.106061598241744 | 16.86 | 33.719 | 50.579 |
| 4.109203190895333 | 16.886 | 33.771 | 50.657 |
| 4.112344783548923 | 16.911 | 33.823 | 50.734 |
| 4.115486376202512 | 16.937 | 33.874 | 50.812 |
| 4.118627968856102 | 16.963 | 33.926 | 50.889 |
| 4.121769561509692 | 16.989 | 33.978 | 50.967 |
| 4.124911154163281 | 17.015 | 34.03 | 51.045 |
| 4.128052746816871 | 17.041 | 34.082 | 51.122 |
| 4.13119433947046 | 17.067 | 34.134 | 51.2 |
| 4.13433593212405 | 17.093 | 34.185 | 51.278 |
| 4.13747752477764 | 17.119 | 34.237 | 51.356 |
| 4.14061911743123 | 17.145 | 34.289 | 51.434 |
| 4.143760710084818 | 17.171 | 34.342 | 51.512 |
| 4.146902302738408 | 17.197 | 34.394 | 51.59 |
| 4.150043895391998 | 17.223 | 34.446 | 51.669 |
| 4.153185488045588 | 17.249 | 34.498 | 51.747 |
| 4.156327080699177 | 17.275 | 34.55 | 51.825 |
| 4.159468673352766 | 17.301 | 34.602 | 51.904 |
| 4.162610266006356 | 17.327 | 34.655 | 51.982 |
| 4.165751858659946 | 17.353 | 34.707 | 52.06 |
| 4.168893451313535 | 17.38 | 34.759 | 52.139 |
| 4.172035043967125 | 17.406 | 34.812 | 52.218 |
| 4.175176636620715 | 17.432 | 34.864 | 52.296 |
| 4.178318229274304 | 17.458 | 34.917 | 52.375 |
| 4.181459821927894 | 17.485 | 34.969 | 52.454 |
| 4.184601414581484 | 17.511 | 35.022 | 52.533 |
| 4.187743007235073 | 17.537 | 35.074 | 52.612 |
| 4.190884599888663 | 17.564 | 35.127 | 52.691 |
| 4.194026192542252 | 17.59 | 35.18 | 52.77 |
| 4.197167785195842 | 17.616 | 35.232 | 52.849 |
| 4.200309377849432 | 17.643 | 35.285 | 52.928 |
| 4.203450970503021 | 17.669 | 35.338 | 53.007 |
| 4.206592563156611 | 17.695 | 35.391 | 53.086 |
| 4.2097341558102 | 17.722 | 35.444 | 53.166 |
| 4.21287574846379 | 17.748 | 35.497 | 53.245 |
| 4.21601734111738 | 17.775 | 35.55 | 53.324 |
| 4.21915893377097 | 17.801 | 35.603 | 53.404 |
| 4.222300526424559 | 17.828 | 35.656 | 53.483 |
| 4.225442119078148 | 17.854 | 35.709 | 53.563 |
| 4.228583711731738 | 17.881 | 35.762 | 53.643 |
| 4.231725304385327 | 17.907 | 35.815 | 53.722 |
| 4.234866897038917 | 17.934 | 35.868 | 53.802 |
| 4.238008489692506 | 17.961 | 35.921 | 53.882 |
| 4.241150082346096 | 17.987 | 35.975 | 53.962 |
| 4.244291674999685 | 18.014 | 36.028 | 54.042 |
| 4.247433267653276 | 18.041 | 36.081 | 54.122 |
| 4.250574860306865 | 18.067 | 36.135 | 54.202 |
| 4.253716452960455 | 18.094 | 36.188 | 54.282 |
| 4.256858045614044 | 18.121 | 36.242 | 54.363 |
| 4.259999638267634 | 18.148 | 36.295 | 54.443 |
| 4.263141230921224 | 18.174 | 36.349 | 54.523 |
| 4.266282823574813 | 18.201 | 36.402 | 54.604 |
| 4.269424416228403 | 18.228 | 36.456 | 54.684 |
| 4.272566008881992 | 18.255 | 36.51 | 54.764 |
| 4.275707601535582 | 18.282 | 36.563 | 54.845 |
| 4.27884919418917 | 18.309 | 36.617 | 54.926 |
| 4.28199078684276 | 18.335 | 36.671 | 55.006 |
| 4.285132379496351 | 18.362 | 36.725 | 55.087 |
| 4.28827397214994 | 18.389 | 36.779 | 55.168 |
| 4.29141556480353 | 18.416 | 36.832 | 55.249 |
| 4.294557157457119 | 18.443 | 36.886 | 55.33 |
| 4.29769875011071 | 18.47 | 36.94 | 55.411 |
| 4.300840342764299 | 18.497 | 36.994 | 55.492 |
| 4.303981935417888 | 18.524 | 37.049 | 55.573 |
| 4.307123528071478 | 18.551 | 37.103 | 55.654 |
| 4.310265120725067 | 18.578 | 37.157 | 55.735 |
| 4.313406713378657 | 18.605 | 37.211 | 55.816 |
| 4.316548306032247 | 18.633 | 37.265 | 55.898 |
| 4.319689898685836 | 18.66 | 37.319 | 55.979 |
| 4.322831491339426 | 18.687 | 37.374 | 56.061 |
| 4.325973083993015 | 18.714 | 37.428 | 56.142 |
| 4.329114676646605 | 18.741 | 37.482 | 56.224 |
| 4.332256269300195 | 18.768 | 37.537 | 56.305 |
| 4.335397861953784 | 18.796 | 37.591 | 56.387 |
| 4.338539454607374 | 18.823 | 37.646 | 56.469 |
| 4.341681047260963 | 18.85 | 37.7 | 56.551 |
| 4.344822639914553 | 18.877 | 37.755 | 56.632 |
| 4.347964232568143 | 18.905 | 37.81 | 56.714 |
| 4.351105825221732 | 18.932 | 37.864 | 56.796 |
| 4.354247417875322 | 18.959 | 37.919 | 56.878 |
| 4.357389010528911 | 18.987 | 37.974 | 56.961 |
| 4.360530603182501 | 19.014 | 38.028 | 57.043 |
| 4.36367219583609 | 19.042 | 38.083 | 57.125 |
| 4.36681378848968 | 19.069 | 38.138 | 57.207 |
| 4.36995538114327 | 19.097 | 38.193 | 57.29 |
| 4.373096973796859 | 19.124 | 38.248 | 57.372 |
| 4.376238566450449 | 19.151 | 38.303 | 57.454 |
| 4.379380159104038 | 19.179 | 38.358 | 57.537 |
| 4.382521751757628 | 19.206 | 38.413 | 57.619 |
| 4.385663344411217 | 19.234 | 38.468 | 57.702 |
| 4.388804937064807 | 19.262 | 38.523 | 57.785 |
| 4.391946529718397 | 19.289 | 38.578 | 57.868 |
| 4.395088122371987 | 19.317 | 38.634 | 57.95 |
| 4.398229715025576 | 19.344 | 38.689 | 58.033 |
| 4.401371307679165 | 19.372 | 38.744 | 58.116 |
| 4.404512900332755 | 19.4 | 38.799 | 58.199 |
| 4.407654492986345 | 19.427 | 38.855 | 58.282 |
| 4.410796085639934 | 19.455 | 38.91 | 58.365 |
| 4.413937678293524 | 19.483 | 38.966 | 58.449 |
| 4.417079270947114 | 19.511 | 39.021 | 58.532 |
| 4.420220863600703 | 19.538 | 39.077 | 58.615 |
| 4.423362456254293 | 19.566 | 39.132 | 58.698 |
| 4.426504048907883 | 19.594 | 39.188 | 58.782 |
| 4.429645641561472 | 19.622 | 39.244 | 58.865 |
| 4.432787234215062 | 19.65 | 39.299 | 58.949 |
| 4.435928826868651 | 19.677 | 39.355 | 59.032 |
| 4.43907041952224 | 19.705 | 39.411 | 59.116 |
| 4.44221201217583 | 19.733 | 39.466 | 59.2 |
| 4.44535360482942 | 19.761 | 39.522 | 59.284 |
| 4.44849519748301 | 19.789 | 39.578 | 59.367 |
| 4.4516367901366 | 19.817 | 39.634 | 59.451 |
| 4.454778382790188 | 19.845 | 39.69 | 59.535 |
| 4.457919975443779 | 19.873 | 39.746 | 59.619 |
| 4.461061568097368 | 19.901 | 39.802 | 59.703 |
| 4.464203160750958 | 19.929 | 39.858 | 59.787 |
| 4.467344753404547 | 19.957 | 39.914 | 59.872 |
| 4.470486346058137 | 19.985 | 39.97 | 59.956 |
| 4.473627938711726 | 20.013 | 40.027 | 60.04 |
| 4.476769531365316 | 20.041 | 40.083 | 60.124 |
| 4.479911124018905 | 20.07 | 40.139 | 60.209 |
| 4.483052716672495 | 20.098 | 40.196 | 60.293 |
| 4.486194309326085 | 20.126 | 40.252 | 60.378 |
| 4.489335901979674 | 20.154 | 40.308 | 60.462 |
| 4.492477494633264 | 20.182 | 40.365 | 60.547 |
| 4.495619087286854 | 20.211 | 40.421 | 60.632 |
| 4.498760679940443 | 20.239 | 40.478 | 60.717 |
| 4.501902272594033 | 20.267 | 40.534 | 60.801 |
| 4.505043865247622 | 20.295 | 40.591 | 60.886 |
| 4.508185457901212 | 20.324 | 40.647 | 60.971 |
| 4.511327050554801 | 20.352 | 40.704 | 61.056 |
| 4.514468643208391 | 20.38 | 40.761 | 61.141 |
| 4.517610235861981 | 20.409 | 40.818 | 61.226 |
| 4.520751828515571 | 20.437 | 40.874 | 61.312 |
| 4.52389342116916 | 20.466 | 40.931 | 61.397 |
| 4.52703501382275 | 20.494 | 40.988 | 61.482 |
| 4.530176606476339 | 20.523 | 41.045 | 61.568 |
| 4.533318199129928 | 20.551 | 41.102 | 61.653 |
| 4.536459791783518 | 20.579 | 41.159 | 61.738 |
| 4.539601384437108 | 20.608 | 41.216 | 61.824 |
| 4.542742977090698 | 20.637 | 41.273 | 61.91 |
| 4.545884569744287 | 20.665 | 41.33 | 61.995 |
| 4.549026162397876 | 20.694 | 41.387 | 62.081 |
| 4.552167755051466 | 20.722 | 41.444 | 62.167 |
| 4.555309347705056 | 20.751 | 41.502 | 62.253 |
| 4.558450940358646 | 20.779 | 41.559 | 62.338 |
| 4.561592533012235 | 20.808 | 41.616 | 62.424 |
| 4.564734125665825 | 20.837 | 41.674 | 62.51 |
| 4.567875718319415 | 20.865 | 41.731 | 62.596 |
| 4.571017310973004 | 20.894 | 41.788 | 62.683 |
| 4.574158903626594 | 20.923 | 41.846 | 62.769 |
| 4.577300496280183 | 20.952 | 41.903 | 62.855 |
| 4.580442088933772 | 20.98 | 41.961 | 62.941 |
| 4.583583681587362 | 21.009 | 42.018 | 63.028 |
| 4.586725274240952 | 21.038 | 42.076 | 63.114 |
| 4.589866866894542 | 21.067 | 42.134 | 63.201 |
| 4.593008459548131 | 21.096 | 42.191 | 63.287 |
| 4.596150052201721 | 21.125 | 42.249 | 63.374 |
| 4.59929164485531 | 21.153 | 42.307 | 63.46 |
| 4.6024332375089 | 21.182 | 42.365 | 63.547 |
| 4.60557483016249 | 21.211 | 42.423 | 63.634 |
| 4.608716422816079 | 21.24 | 42.481 | 63.721 |
| 4.611858015469668 | 21.269 | 42.538 | 63.808 |
| 4.614999608123258 | 21.298 | 42.596 | 63.895 |
| 4.618141200776848 | 21.327 | 42.654 | 63.982 |
| 4.621282793430437 | 21.356 | 42.713 | 64.069 |
| 4.624424386084027 | 21.385 | 42.771 | 64.156 |
| 4.627565978737617 | 21.414 | 42.829 | 64.243 |
| 4.630707571391206 | 21.443 | 42.887 | 64.33 |
| 4.633849164044795 | 21.473 | 42.945 | 64.418 |
| 4.636990756698386 | 21.502 | 43.003 | 64.505 |
| 4.640132349351975 | 21.531 | 43.062 | 64.592 |
| 4.643273942005564 | 21.56 | 43.12 | 64.68 |
| 4.646415534659154 | 21.589 | 43.178 | 64.768 |
| 4.649557127312744 | 21.618 | 43.237 | 64.855 |
| 4.652698719966334 | 21.648 | 43.295 | 64.943 |
| 4.655840312619923 | 21.677 | 43.354 | 65.031 |
| 4.658981905273513 | 21.706 | 43.412 | 65.118 |
| 4.662123497927102 | 21.735 | 43.471 | 65.206 |
| 4.665265090580692 | 21.765 | 43.529 | 65.294 |
| 4.668406683234282 | 21.794 | 43.588 | 65.382 |
| 4.671548275887871 | 21.823 | 43.647 | 65.47 |
| 4.674689868541461 | 21.853 | 43.705 | 65.558 |
| 4.67783146119505 | 21.882 | 43.764 | 65.646 |
| 4.68097305384864 | 21.912 | 43.823 | 65.735 |
| 4.68411464650223 | 21.941 | 43.882 | 65.823 |
| 4.687256239155819 | 21.97 | 43.941 | 65.911 |
| 4.690397831809409 | 22 | 44 | 65.999 |
| 4.693539424462998 | 22.029 | 44.059 | 66.088 |
| 4.696681017116588 | 22.059 | 44.118 | 66.176 |
| 4.699822609770177 | 22.088 | 44.177 | 66.265 |
| 4.702964202423767 | 22.118 | 44.236 | 66.354 |
| 4.706105795077356 | 22.147 | 44.295 | 66.442 |
| 4.709247387730946 | 22.177 | 44.354 | 66.531 |
| 4.712388980384535 | 22.207 | 44.413 | 66.62 |
| 4.715530573038126 | 22.236 | 44.472 | 66.709 |
| 4.718672165691715 | 22.266 | 44.532 | 66.798 |
| 4.721813758345305 | 22.296 | 44.591 | 66.887 |
| 4.724955350998894 | 22.325 | 44.65 | 66.976 |
| 4.728096943652484 | 22.355 | 44.71 | 67.065 |
| 4.731238536306074 | 22.385 | 44.769 | 67.154 |
| 4.734380128959663 | 22.414 | 44.829 | 67.243 |
| 4.737521721613253 | 22.444 | 44.888 | 67.332 |
| 4.740663314266842 | 22.474 | 44.948 | 67.422 |
| 4.743804906920432 | 22.504 | 45.007 | 67.511 |
| 4.74694649957402 | 22.534 | 45.067 | 67.601 |
| 4.750088092227611 | 22.563 | 45.127 | 67.69 |
| 4.7532296848812 | 22.593 | 45.186 | 67.78 |
| 4.75637127753479 | 22.623 | 45.246 | 67.869 |
| 4.75951287018838 | 22.653 | 45.306 | 67.959 |
| 4.76265446284197 | 22.683 | 45.366 | 68.049 |
| 4.765796055495559 | 22.713 | 45.426 | 68.138 |
| 4.768937648149149 | 22.743 | 45.486 | 68.228 |
| 4.772079240802738 | 22.773 | 45.545 | 68.318 |
| 4.775220833456327 | 22.803 | 45.605 | 68.408 |
| 4.778362426109917 | 22.833 | 45.665 | 68.498 |
| 4.781504018763507 | 22.863 | 45.726 | 68.588 |
| 4.784645611417097 | 22.893 | 45.786 | 68.679 |
| 4.787787204070686 | 22.923 | 45.846 | 68.769 |
| 4.790928796724275 | 22.953 | 45.906 | 68.859 |
| 4.794070389377865 | 22.983 | 45.966 | 68.949 |
| 4.797211982031455 | 23.013 | 46.026 | 69.04 |
| 4.800353574685045 | 23.043 | 46.087 | 69.13 |
| 4.803495167338634 | 23.074 | 46.147 | 69.221 |
| 4.806636759992224 | 23.104 | 46.208 | 69.311 |
| 4.809778352645814 | 23.134 | 46.268 | 69.402 |
| 4.812919945299403 | 23.164 | 46.328 | 69.493 |
| 4.816061537952993 | 23.194 | 46.389 | 69.583 |
| 4.819203130606582 | 23.225 | 46.449 | 69.674 |
| 4.822344723260172 | 23.255 | 46.51 | 69.765 |
| 4.825486315913761 | 23.285 | 46.571 | 69.856 |
| 4.828627908567351 | 23.316 | 46.631 | 69.947 |
| 4.83176950122094 | 23.346 | 46.692 | 70.038 |
| 4.83491109387453 | 23.376 | 46.753 | 70.129 |
| 4.83805268652812 | 23.407 | 46.814 | 70.22 |
| 4.841194279181709 | 23.437 | 46.874 | 70.311 |
| 4.844335871835299 | 23.468 | 46.935 | 70.403 |
| 4.847477464488889 | 23.498 | 46.996 | 70.494 |
| 4.850619057142478 | 23.529 | 47.057 | 70.586 |
| 4.853760649796068 | 23.559 | 47.118 | 70.677 |
| 4.856902242449657 | 23.589 | 47.179 | 70.768 |
| 4.860043835103247 | 23.62 | 47.24 | 70.86 |
| 4.863185427756837 | 23.651 | 47.301 | 70.952 |
| 4.866327020410426 | 23.681 | 47.362 | 71.043 |
| 4.869468613064015 | 23.712 | 47.423 | 71.135 |
| 4.872610205717605 | 23.742 | 47.485 | 71.227 |
| 4.875751798371195 | 23.773 | 47.546 | 71.319 |
| 4.878893391024784 | 23.804 | 47.607 | 71.411 |
| 4.882034983678374 | 23.834 | 47.669 | 71.503 |
| 4.885176576331964 | 23.865 | 47.73 | 71.595 |
| 4.888318168985553 | 23.896 | 47.791 | 71.687 |
| 4.891459761639143 | 23.926 | 47.853 | 71.779 |
| 4.894601354292733 | 23.957 | 47.914 | 71.871 |
| 4.897742946946322 | 23.988 | 47.976 | 71.964 |
| 4.900884539599912 | 24.019 | 48.037 | 72.056 |
| 4.904026132253501 | 24.049 | 48.099 | 72.148 |
| 4.907167724907091 | 24.08 | 48.161 | 72.241 |
| 4.91030931756068 | 24.111 | 48.222 | 72.333 |
| 4.91345091021427 | 24.142 | 48.284 | 72.426 |
| 4.91659250286786 | 24.173 | 48.346 | 72.519 |
| 4.91973409552145 | 24.204 | 48.408 | 72.611 |
| 4.922875688175039 | 24.235 | 48.469 | 72.704 |
| 4.926017280828628 | 24.266 | 48.531 | 72.797 |
| 4.929158873482218 | 24.297 | 48.593 | 72.89 |
| 4.932300466135808 | 24.328 | 48.655 | 72.983 |
| 4.935442058789397 | 24.359 | 48.717 | 73.076 |
| 4.938583651442987 | 24.39 | 48.779 | 73.169 |
| 4.941725244096576 | 24.421 | 48.841 | 73.262 |
| 4.944866836750166 | 24.452 | 48.903 | 73.355 |
| 4.948008429403755 | 24.483 | 48.966 | 73.448 |
| 4.951150022057345 | 24.514 | 49.028 | 73.542 |
| 4.954291614710935 | 24.545 | 49.09 | 73.635 |
| 4.957433207364524 | 24.576 | 49.152 | 73.728 |
| 4.960574800018114 | 24.607 | 49.215 | 73.822 |
| 4.963716392671704 | 24.638 | 49.277 | 73.915 |
| 4.966857985325293 | 24.67 | 49.339 | 74.009 |
| 4.969999577978883 | 24.701 | 49.402 | 74.103 |
| 4.973141170632472 | 24.732 | 49.464 | 74.196 |
| 4.976282763286062 | 24.763 | 49.527 | 74.29 |
| 4.979424355939651 | 24.795 | 49.589 | 74.384 |
| 4.982565948593241 | 24.826 | 49.652 | 74.478 |
| 4.985707541246831 | 24.857 | 49.715 | 74.572 |
| 4.98884913390042 | 24.889 | 49.777 | 74.666 |
| 4.99199072655401 | 24.92 | 49.84 | 74.76 |
| 4.9951323192076 | 24.951 | 49.903 | 74.854 |
| 4.99827391186119 | 24.983 | 49.965 | 74.948 |
| 5.00141550451478 | 25.014 | 50.028 | 75.042 |
| 5.004557097168369 | 25.046 | 50.091 | 75.137 |
| 5.007698689821958 | 25.077 | 50.154 | 75.231 |
| 5.010840282475548 | 25.109 | 50.217 | 75.326 |
| 5.013981875129137 | 25.14 | 50.28 | 75.42 |
| 5.017123467782727 | 25.172 | 50.343 | 75.515 |
| 5.020265060436317 | 25.203 | 50.406 | 75.609 |
| 5.023406653089906 | 25.235 | 50.469 | 75.704 |
| 5.026548245743496 | 25.266 | 50.532 | 75.799 |
| 5.029689838397085 | 25.298 | 50.596 | 75.893 |
| 5.032831431050674 | 25.329 | 50.659 | 75.988 |
| 5.035973023704264 | 25.361 | 50.722 | 76.083 |
| 5.039114616357854 | 25.393 | 50.785 | 76.178 |
| 5.042256209011444 | 25.424 | 50.849 | 76.273 |
| 5.045397801665033 | 25.456 | 50.912 | 76.368 |
| 5.048539394318622 | 25.488 | 50.976 | 76.463 |
| 5.051680986972213 | 25.519 | 51.039 | 76.558 |
| 5.054822579625802 | 25.551 | 51.102 | 76.654 |
| 5.057964172279392 | 25.583 | 51.166 | 76.749 |
| 5.061105764932981 | 25.615 | 51.23 | 76.844 |
| 5.064247357586571 | 25.647 | 51.293 | 76.94 |
| 5.067388950240161 | 25.678 | 51.357 | 77.035 |
| 5.07053054289375 | 25.71 | 51.421 | 77.131 |
| 5.07367213554734 | 25.742 | 51.484 | 77.226 |
| 5.07681372820093 | 25.774 | 51.548 | 77.322 |
| 5.079955320854519 | 25.806 | 51.612 | 77.418 |
| 5.083096913508108 | 25.838 | 51.676 | 77.514 |
| 5.086238506161698 | 25.87 | 51.74 | 77.609 |
| 5.089380098815288 | 25.902 | 51.804 | 77.705 |
| 5.092521691468877 | 25.934 | 51.868 | 77.801 |
| 5.095663284122466 | 25.966 | 51.932 | 77.897 |
| 5.098804876776057 | 25.998 | 51.996 | 77.993 |
| 5.101946469429646 | 26.03 | 52.06 | 78.09 |
| 5.105088062083236 | 26.062 | 52.124 | 78.186 |
| 5.108229654736825 | 26.094 | 52.188 | 78.282 |
| 5.111371247390415 | 26.126 | 52.252 | 78.378 |
| 5.114512840044005 | 26.158 | 52.316 | 78.475 |
| 5.117654432697594 | 26.19 | 52.381 | 78.571 |
| 5.120796025351184 | 26.223 | 52.445 | 78.668 |
| 5.123937618004773 | 26.255 | 52.509 | 78.764 |
| 5.127079210658363 | 26.287 | 52.574 | 78.861 |
| 5.130220803311953 | 26.319 | 52.638 | 78.957 |
| 5.133362395965542 | 26.351 | 52.703 | 79.054 |
| 5.136503988619131 | 26.384 | 52.767 | 79.151 |
| 5.13964558127272 | 26.416 | 52.832 | 79.248 |
| 5.142787173926311 | 26.448 | 52.897 | 79.345 |
| 5.1459287665799 | 26.481 | 52.961 | 79.442 |
| 5.14907035923349 | 26.513 | 53.026 | 79.539 |
| 5.15221195188708 | 26.545 | 53.091 | 79.636 |
| 5.15535354454067 | 26.578 | 53.155 | 79.733 |
| 5.158495137194259 | 26.61 | 53.22 | 79.83 |
| 5.161636729847848 | 26.642 | 53.285 | 79.927 |
| 5.164778322501438 | 26.675 | 53.35 | 80.025 |
| 5.167919915155028 | 26.707 | 53.415 | 80.122 |
| 5.171061507808617 | 26.74 | 53.48 | 80.22 |
| 5.174203100462206 | 26.772 | 53.545 | 80.317 |
| 5.177344693115796 | 26.805 | 53.61 | 80.415 |
| 5.180486285769386 | 26.837 | 53.675 | 80.512 |
| 5.183627878422976 | 26.87 | 53.74 | 80.61 |
| 5.186769471076565 | 26.903 | 53.805 | 80.708 |
| 5.189911063730155 | 26.935 | 53.87 | 80.806 |
| 5.193052656383744 | 26.968 | 53.936 | 80.903 |
| 5.196194249037334 | 27 | 54.001 | 81.001 |
| 5.199335841690924 | 27.033 | 54.066 | 81.099 |
| 5.202477434344513 | 27.066 | 54.132 | 81.197 |
| 5.205619026998103 | 27.098 | 54.197 | 81.295 |
| 5.208760619651692 | 27.131 | 54.262 | 81.394 |
| 5.211902212305282 | 27.164 | 54.328 | 81.492 |
| 5.215043804958871 | 27.197 | 54.393 | 81.59 |
| 5.218185397612461 | 27.229 | 54.459 | 81.688 |
| 5.221326990266051 | 27.262 | 54.525 | 81.787 |
| 5.22446858291964 | 27.295 | 54.59 | 81.885 |
| 5.22761017557323 | 27.328 | 54.656 | 81.984 |
| 5.23075176822682 | 27.361 | 54.722 | 82.082 |
| 5.23389336088041 | 27.394 | 54.787 | 82.181 |
| 5.237034953533999 | 27.427 | 54.853 | 82.28 |
| 5.240176546187588 | 27.459 | 54.919 | 82.378 |
| 5.243318138841178 | 27.492 | 54.985 | 82.477 |
| 5.246459731494767 | 27.525 | 55.051 | 82.576 |
| 5.249601324148357 | 27.558 | 55.117 | 82.675 |
| 5.252742916801947 | 27.591 | 55.183 | 82.774 |
| 5.255884509455536 | 27.624 | 55.249 | 82.873 |
| 5.259026102109125 | 27.657 | 55.315 | 82.972 |
| 5.262167694762715 | 27.69 | 55.381 | 83.071 |
| 5.265309287416305 | 27.723 | 55.447 | 83.17 |
| 5.268450880069895 | 27.757 | 55.513 | 83.27 |
| 5.271592472723484 | 27.79 | 55.579 | 83.369 |
| 5.274734065377074 | 27.823 | 55.646 | 83.468 |
| 5.277875658030664 | 27.856 | 55.712 | 83.568 |
| 5.281017250684253 | 27.889 | 55.778 | 83.667 |
| 5.284158843337843 | 27.922 | 55.845 | 83.767 |
| 5.287300435991432 | 27.956 | 55.911 | 83.867 |
| 5.290442028645022 | 27.989 | 55.978 | 83.966 |
| 5.293583621298612 | 28.022 | 56.044 | 84.066 |
| 5.296725213952201 | 28.055 | 56.111 | 84.166 |
| 5.299866806605791 | 28.089 | 56.177 | 84.266 |
| 5.30300839925938 | 28.122 | 56.244 | 84.366 |
| 5.30614999191297 | 28.155 | 56.31 | 84.466 |
| 5.30929158456656 | 28.189 | 56.377 | 84.566 |
| 5.312433177220149 | 28.222 | 56.444 | 84.666 |
| 5.315574769873739 | 28.255 | 56.511 | 84.766 |
| 5.318716362527328 | 28.289 | 56.577 | 84.866 |
| 5.321857955180918 | 28.322 | 56.644 | 84.967 |
| 5.324999547834508 | 28.356 | 56.711 | 85.067 |
| 5.328141140488097 | 28.389 | 56.778 | 85.167 |
| 5.331282733141686 | 28.423 | 56.845 | 85.268 |
| 5.334424325795276 | 28.456 | 56.912 | 85.368 |
| 5.337565918448866 | 28.49 | 56.979 | 85.469 |
| 5.340707511102456 | 28.523 | 57.046 | 85.569 |
| 5.343849103756045 | 28.557 | 57.113 | 85.67 |
| 5.346990696409634 | 28.59 | 57.181 | 85.771 |
| 5.350132289063224 | 28.624 | 57.248 | 85.872 |
| 5.353273881716814 | 28.658 | 57.315 | 85.973 |
| 5.356415474370403 | 28.691 | 57.382 | 86.074 |
| 5.359557067023993 | 28.725 | 57.45 | 86.175 |
| 5.362698659677583 | 28.759 | 57.517 | 86.276 |
| 5.365840252331172 | 28.792 | 57.584 | 86.377 |
| 5.368981844984762 | 28.826 | 57.652 | 86.478 |
| 5.372123437638351 | 28.86 | 57.719 | 86.579 |
| 5.375265030291941 | 28.893 | 57.787 | 86.68 |
| 5.378406622945531 | 28.927 | 57.855 | 86.782 |
| 5.38154821559912 | 28.961 | 57.922 | 86.883 |
| 5.38468980825271 | 28.995 | 57.99 | 86.985 |
| 5.387831400906299 | 29.029 | 58.057 | 87.086 |
| 5.39097299355989 | 29.063 | 58.125 | 87.188 |
| 5.394114586213479 | 29.096 | 58.193 | 87.289 |
| 5.397256178867068 | 29.13 | 58.261 | 87.391 |
| 5.400397771520657 | 29.164 | 58.329 | 87.493 |
| 5.403539364174247 | 29.198 | 58.396 | 87.595 |
| 5.406680956827837 | 29.232 | 58.464 | 87.697 |
| 5.409822549481426 | 29.266 | 58.532 | 87.799 |
| 5.412964142135016 | 29.3 | 58.6 | 87.901 |
| 5.416105734788605 | 29.334 | 58.668 | 88.003 |
| 5.419247327442195 | 29.368 | 58.736 | 88.105 |
| 5.422388920095785 | 29.402 | 58.805 | 88.207 |
| 5.425530512749375 | 29.436 | 58.873 | 88.309 |
| 5.428672105402964 | 29.47 | 58.941 | 88.411 |
| 5.431813698056554 | 29.505 | 59.009 | 88.514 |
| 5.434955290710143 | 29.539 | 59.077 | 88.616 |
| 5.438096883363733 | 29.573 | 59.146 | 88.719 |
| 5.441238476017322 | 29.607 | 59.214 | 88.821 |
| 5.444380068670912 | 29.641 | 59.283 | 88.924 |
| 5.447521661324502 | 29.675 | 59.351 | 89.026 |
| 5.450663253978091 | 29.71 | 59.419 | 89.129 |
| 5.453804846631681 | 29.744 | 59.488 | 89.232 |
| 5.456946439285271 | 29.778 | 59.557 | 89.335 |
| 5.46008803193886 | 29.813 | 59.625 | 89.438 |
| 5.46322962459245 | 29.847 | 59.694 | 89.541 |
| 5.466371217246039 | 29.881 | 59.762 | 89.644 |
| 5.46951280989963 | 29.916 | 59.831 | 89.747 |
| 5.472654402553218 | 29.95 | 59.9 | 89.85 |
| 5.475795995206808 | 29.984 | 59.969 | 89.953 |
| 5.478937587860398 | 30.019 | 60.038 | 90.056 |
| 5.482079180513987 | 30.053 | 60.106 | 90.16 |
| 5.485220773167577 | 30.088 | 60.175 | 90.263 |
| 5.488362365821166 | 30.122 | 60.244 | 90.366 |
| 5.491503958474756 | 30.157 | 60.313 | 90.47 |
| 5.494645551128346 | 30.191 | 60.382 | 90.573 |
| 5.497787143781935 | 30.226 | 60.451 | 90.677 |
| 5.500928736435525 | 30.26 | 60.52 | 90.781 |
| 5.504070329089115 | 30.295 | 60.59 | 90.884 |
| 5.507211921742704 | 30.329 | 60.659 | 90.988 |
| 5.510353514396294 | 30.364 | 60.728 | 91.092 |
| 5.513495107049883 | 30.399 | 60.797 | 91.196 |
| 5.516636699703473 | 30.433 | 60.867 | 91.3 |
| 5.519778292357062 | 30.468 | 60.936 | 91.404 |
| 5.522919885010652 | 30.503 | 61.005 | 91.508 |
| 5.526061477664242 | 30.537 | 61.075 | 91.612 |
| 5.529203070317831 | 30.572 | 61.144 | 91.716 |
| 5.532344662971421 | 30.607 | 61.214 | 91.821 |
| 5.535486255625011 | 30.642 | 61.283 | 91.925 |
| 5.5386278482786 | 30.676 | 61.353 | 92.029 |
| 5.54176944093219 | 30.711 | 61.422 | 92.134 |
| 5.544911033585779 | 30.746 | 61.492 | 92.238 |
| 5.54805262623937 | 30.781 | 61.562 | 92.343 |
| 5.551194218892959 | 30.816 | 61.632 | 92.447 |
| 5.554335811546548 | 30.851 | 61.701 | 92.552 |
| 5.557477404200137 | 30.886 | 61.771 | 92.657 |
| 5.560618996853727 | 30.92 | 61.841 | 92.761 |
| 5.563760589507317 | 30.955 | 61.911 | 92.866 |
| 5.566902182160906 | 30.99 | 61.981 | 92.971 |
| 5.570043774814496 | 31.025 | 62.051 | 93.076 |
| 5.573185367468086 | 31.06 | 62.121 | 93.181 |
| 5.576326960121675 | 31.095 | 62.191 | 93.286 |
| 5.579468552775264 | 31.13 | 62.261 | 93.391 |
| 5.582610145428854 | 31.166 | 62.331 | 93.497 |
| 5.585751738082444 | 31.201 | 62.401 | 93.602 |
| 5.588893330736034 | 31.236 | 62.471 | 93.707 |
| 5.592034923389623 | 31.271 | 62.542 | 93.813 |
| 5.595176516043213 | 31.306 | 62.612 | 93.918 |
| 5.598318108696803 | 31.341 | 62.682 | 94.023 |
| 5.601459701350392 | 31.376 | 62.753 | 94.129 |
| 5.604601294003982 | 31.412 | 62.823 | 94.235 |
| 5.607742886657571 | 31.447 | 62.894 | 94.34 |
| 5.610884479311161 | 31.482 | 62.964 | 94.446 |
| 5.61402607196475 | 31.517 | 63.035 | 94.552 |
| 5.61716766461834 | 31.553 | 63.105 | 94.658 |
| 5.62030925727193 | 31.588 | 63.176 | 94.764 |
| 5.623450849925519 | 31.623 | 63.246 | 94.87 |
| 5.626592442579109 | 31.659 | 63.317 | 94.976 |
| 5.629734035232698 | 31.694 | 63.388 | 95.082 |
| 5.632875627886288 | 31.729 | 63.459 | 95.188 |
| 5.636017220539878 | 31.765 | 63.529 | 95.294 |
| 5.639158813193467 | 31.8 | 63.6 | 95.4 |
| 5.642300405847057 | 31.836 | 63.671 | 95.507 |
| 5.645441998500646 | 31.871 | 63.742 | 95.613 |
| 5.648583591154236 | 31.906 | 63.813 | 95.719 |
| 5.651725183807825 | 31.942 | 63.884 | 95.826 |
| 5.654866776461415 | 31.978 | 63.955 | 95.933 |
| 5.658008369115005 | 32.013 | 64.026 | 96.039 |
| 5.661149961768594 | 32.049 | 64.097 | 96.146 |
| 5.664291554422184 | 32.084 | 64.168 | 96.253 |
| 5.667433147075774 | 32.12 | 64.24 | 96.359 |
| 5.670574739729363 | 32.155 | 64.311 | 96.466 |
| 5.673716332382953 | 32.191 | 64.382 | 96.573 |
| 5.676857925036542 | 32.227 | 64.453 | 96.68 |
| 5.679999517690132 | 32.262 | 64.525 | 96.787 |
| 5.683141110343721 | 32.298 | 64.596 | 96.894 |
| 5.686282702997311 | 32.334 | 64.668 | 97.001 |
| 5.689424295650901 | 32.37 | 64.739 | 97.109 |
| 5.69256588830449 | 32.405 | 64.811 | 97.216 |
| 5.69570748095808 | 32.441 | 64.882 | 97.323 |
| 5.69884907361167 | 32.477 | 64.954 | 97.431 |
| 5.701990666265259 | 32.513 | 65.025 | 97.538 |
| 5.705132258918849 | 32.549 | 65.097 | 97.646 |
| 5.708273851572438 | 32.584 | 65.169 | 97.753 |
| 5.711415444226028 | 32.62 | 65.241 | 97.861 |
| 5.714557036879618 | 32.656 | 65.312 | 97.968 |
| 5.717698629533207 | 32.692 | 65.384 | 98.076 |
| 5.720840222186797 | 32.728 | 65.456 | 98.184 |
| 5.723981814840386 | 32.764 | 65.528 | 98.292 |
| 5.727123407493976 | 32.8 | 65.6 | 98.4 |
| 5.730265000147565 | 32.836 | 65.672 | 98.508 |
| 5.733406592801155 | 32.872 | 65.744 | 98.616 |
| 5.736548185454744 | 32.908 | 65.816 | 98.724 |
| 5.739689778108334 | 32.944 | 65.888 | 98.832 |
| 5.742831370761924 | 32.98 | 65.96 | 98.94 |
| 5.745972963415514 | 33.016 | 66.032 | 99.049 |
| 5.749114556069103 | 33.052 | 66.105 | 99.157 |
| 5.752256148722693 | 33.088 | 66.177 | 99.265 |
| 5.755397741376282 | 33.125 | 66.249 | 99.374 |
| 5.758539334029872 | 33.161 | 66.322 | 99.482 |
| 5.761680926683462 | 33.197 | 66.394 | 99.591 |
| 5.764822519337051 | 33.233 | 66.466 | 99.7 |
| 5.767964111990641 | 33.269 | 66.539 | 99.808 |
| 5.77110570464423 | 33.306 | 66.611 | 99.917 |
| 5.77424729729782 | 33.342 | 66.684 | 100.026 |
| 5.77738888995141 | 33.378 | 66.756 | 100.135 |
| 5.780530482605 | 33.415 | 66.829 | 100.244 |
| 5.783672075258588 | 33.451 | 66.902 | 100.353 |
| 5.786813667912178 | 33.487 | 66.974 | 100.462 |
| 5.789955260565768 | 33.524 | 67.047 | 100.571 |
| 5.793096853219358 | 33.56 | 67.12 | 100.68 |
| 5.796238445872947 | 33.596 | 67.193 | 100.789 |
| 5.799380038526537 | 33.633 | 67.266 | 100.898 |
| 5.802521631180126 | 33.669 | 67.339 | 101.008 |
| 5.805663223833715 | 33.706 | 67.411 | 101.117 |
| 5.808804816487306 | 33.742 | 67.484 | 101.227 |
| 5.811946409140895 | 33.779 | 67.557 | 101.336 |
| 5.815088001794485 | 33.815 | 67.63 | 101.446 |
| 5.818229594448074 | 33.852 | 67.704 | 101.555 |
| 5.821371187101663 | 33.888 | 67.777 | 101.665 |
| 5.824512779755254 | 33.925 | 67.85 | 101.775 |
| 5.827654372408843 | 33.962 | 67.923 | 101.885 |
| 5.830795965062433 | 33.998 | 67.996 | 101.995 |
| 5.833937557716022 | 34.035 | 68.07 | 102.104 |
| 5.837079150369612 | 34.071 | 68.143 | 102.214 |
| 5.840220743023201 | 34.108 | 68.216 | 102.325 |
| 5.843362335676791 | 34.145 | 68.29 | 102.435 |
| 5.846503928330381 | 34.182 | 68.363 | 102.545 |
| 5.84964552098397 | 34.218 | 68.437 | 102.655 |
| 5.85278711363756 | 34.255 | 68.51 | 102.765 |
| 5.85592870629115 | 34.292 | 68.584 | 102.876 |
| 5.85907029894474 | 34.329 | 68.657 | 102.986 |
| 5.862211891598329 | 34.366 | 68.731 | 103.097 |
| 5.865353484251918 | 34.402 | 68.805 | 103.207 |
| 5.868495076905508 | 34.439 | 68.878 | 103.318 |
| 5.871636669559098 | 34.476 | 68.952 | 103.428 |
| 5.874778262212687 | 34.513 | 69.026 | 103.539 |
| 5.877919854866277 | 34.55 | 69.1 | 103.65 |
| 5.881061447519866 | 34.587 | 69.174 | 103.761 |
| 5.884203040173456 | 34.624 | 69.248 | 103.872 |
| 5.887344632827046 | 34.661 | 69.322 | 103.982 |
| 5.890486225480635 | 34.698 | 69.396 | 104.093 |
| 5.893627818134224 | 34.735 | 69.47 | 104.205 |
| 5.896769410787814 | 34.772 | 69.544 | 104.316 |
| 5.899911003441404 | 34.809 | 69.618 | 104.427 |
| 5.903052596094994 | 34.846 | 69.692 | 104.538 |
| 5.906194188748583 | 34.883 | 69.766 | 104.649 |
| 5.909335781402172 | 34.92 | 69.84 | 104.761 |
| 5.912477374055762 | 34.957 | 69.915 | 104.872 |
| 5.915618966709352 | 34.995 | 69.989 | 104.984 |
| 5.918760559362942 | 35.032 | 70.063 | 105.095 |
| 5.921902152016531 | 35.069 | 70.138 | 105.207 |
| 5.92504374467012 | 35.106 | 70.212 | 105.318 |
| 5.92818533732371 | 35.143 | 70.287 | 105.43 |
| 5.9313269299773 | 35.181 | 70.361 | 105.542 |
| 5.93446852263089 | 35.218 | 70.436 | 105.654 |
| 5.93761011528448 | 35.255 | 70.51 | 105.766 |
| 5.940751707938068 | 35.293 | 70.585 | 105.878 |
| 5.943893300591658 | 35.33 | 70.66 | 105.99 |
| 5.947034893245248 | 35.367 | 70.734 | 106.102 |
| 5.950176485898837 | 35.405 | 70.809 | 106.214 |
| 5.953318078552427 | 35.442 | 70.884 | 106.326 |
| 5.956459671206017 | 35.479 | 70.959 | 106.438 |
| 5.959601263859606 | 35.517 | 71.034 | 106.551 |
| 5.962742856513196 | 35.554 | 71.109 | 106.663 |
| 5.965884449166785 | 35.592 | 71.184 | 106.775 |
| 5.969026041820375 | 35.629 | 71.259 | 106.888 |
| 5.972167634473964 | 35.667 | 71.334 | 107 |
| 5.975309227127554 | 35.704 | 71.409 | 107.113 |
| 5.978450819781144 | 35.742 | 71.484 | 107.226 |
| 5.981592412434733 | 35.779 | 71.559 | 107.338 |
| 5.984734005088323 | 35.817 | 71.634 | 107.451 |
| 5.987875597741913 | 35.855 | 71.709 | 107.564 |
| 5.991017190395502 | 35.892 | 71.785 | 107.677 |
| 5.994158783049092 | 35.93 | 71.86 | 107.79 |
| 5.997300375702681 | 35.968 | 71.935 | 107.903 |
| 6.000441968356271 | 36.005 | 72.011 | 108.016 |
| 6.003583561009861 | 36.043 | 72.086 | 108.129 |
| 6.00672515366345 | 36.081 | 72.161 | 108.242 |
| 6.00986674631704 | 36.118 | 72.237 | 108.355 |
| 6.01300833897063 | 36.156 | 72.313 | 108.469 |
| 6.01614993162422 | 36.194 | 72.388 | 108.582 |
| 6.019291524277808 | 36.232 | 72.464 | 108.696 |
| 6.022433116931398 | 36.27 | 72.539 | 108.809 |
| 6.025574709584988 | 36.308 | 72.615 | 108.923 |
| 6.028716302238577 | 36.345 | 72.691 | 109.036 |
| 6.031857894892167 | 36.383 | 72.767 | 109.15 |
| 6.034999487545757 | 36.421 | 72.842 | 109.264 |
| 6.038141080199346 | 36.459 | 72.918 | 109.377 |
| 6.041282672852935 | 36.497 | 72.994 | 109.491 |
| 6.044424265506525 | 36.535 | 73.07 | 109.605 |
| 6.047565858160115 | 36.573 | 73.146 | 109.719 |
| 6.050707450813704 | 36.611 | 73.222 | 109.833 |
| 6.053849043467294 | 36.649 | 73.298 | 109.947 |
| 6.056990636120884 | 36.687 | 73.374 | 110.061 |
| 6.060132228774473 | 36.725 | 73.45 | 110.176 |
| 6.063273821428063 | 36.763 | 73.527 | 110.29 |
| 6.066415414081653 | 36.801 | 73.603 | 110.404 |
| 6.069557006735242 | 36.84 | 73.679 | 110.519 |
| 6.072698599388831 | 36.878 | 73.755 | 110.633 |
| 6.07584019204242 | 36.916 | 73.832 | 110.748 |
| 6.078981784696011 | 36.954 | 73.908 | 110.862 |
| 6.082123377349601 | 36.992 | 73.984 | 110.977 |
| 6.08526497000319 | 37.03 | 74.061 | 111.091 |
| 6.08840656265678 | 37.069 | 74.137 | 111.206 |
| 6.09154815531037 | 37.107 | 74.214 | 111.321 |
| 6.094689747963959 | 37.145 | 74.29 | 111.436 |
| 6.097831340617549 | 37.184 | 74.367 | 111.551 |
| 6.100972933271138 | 37.222 | 74.444 | 111.666 |
| 6.104114525924728 | 37.26 | 74.52 | 111.781 |
| 6.107256118578317 | 37.299 | 74.597 | 111.896 |
| 6.110397711231907 | 37.337 | 74.674 | 112.011 |
| 6.113539303885497 | 37.375 | 74.751 | 112.126 |
| 6.116680896539086 | 37.414 | 74.828 | 112.241 |
| 6.119822489192675 | 37.452 | 74.904 | 112.357 |
| 6.122964081846265 | 37.491 | 74.981 | 112.472 |
| 6.126105674499855 | 37.529 | 75.058 | 112.588 |
| 6.129247267153445 | 37.568 | 75.135 | 112.703 |
| 6.132388859807034 | 37.606 | 75.212 | 112.819 |
| 6.135530452460624 | 37.645 | 75.289 | 112.934 |
| 6.138672045114213 | 37.683 | 75.367 | 113.05 |
| 6.141813637767803 | 37.722 | 75.444 | 113.166 |
| 6.144955230421393 | 37.76 | 75.521 | 113.281 |
| 6.148096823074982 | 37.799 | 75.598 | 113.397 |
| 6.151238415728571 | 37.838 | 75.675 | 113.513 |
| 6.154380008382161 | 37.876 | 75.753 | 113.629 |
| 6.157521601035751 | 37.915 | 75.83 | 113.745 |
| 6.16066319368934 | 37.954 | 75.908 | 113.861 |
| 6.16380478634293 | 37.992 | 75.985 | 113.977 |
| 6.16694637899652 | 38.031 | 76.062 | 114.094 |
| 6.170087971650109 | 38.07 | 76.14 | 114.21 |
| 6.173229564303698 | 38.109 | 76.218 | 114.326 |
| 6.176371156957289 | 38.148 | 76.295 | 114.443 |
| 6.179512749610878 | 38.186 | 76.373 | 114.559 |
| 6.182654342264468 | 38.225 | 76.45 | 114.676 |
| 6.185795934918057 | 38.264 | 76.528 | 114.792 |
| 6.188937527571647 | 38.303 | 76.606 | 114.909 |
| 6.192079120225237 | 38.342 | 76.684 | 115.026 |
| 6.195220712878826 | 38.381 | 76.762 | 115.142 |
| 6.198362305532415 | 38.42 | 76.839 | 115.259 |
| 6.201503898186005 | 38.459 | 76.917 | 115.376 |
| 6.204645490839594 | 38.498 | 76.995 | 115.493 |
| 6.207787083493184 | 38.537 | 77.073 | 115.61 |
| 6.210928676146774 | 38.576 | 77.151 | 115.727 |
| 6.214070268800364 | 38.615 | 77.229 | 115.844 |
| 6.217211861453953 | 38.654 | 77.307 | 115.961 |
| 6.220353454107543 | 38.693 | 77.386 | 116.078 |
| 6.223495046761133 | 38.732 | 77.464 | 116.196 |
| 6.226636639414722 | 38.771 | 77.542 | 116.313 |
| 6.229778232068312 | 38.81 | 77.62 | 116.43 |
| 6.232919824721901 | 38.849 | 77.699 | 116.548 |
| 6.236061417375491 | 38.888 | 77.777 | 116.665 |
| 6.23920301002908 | 38.928 | 77.855 | 116.783 |
| 6.24234460268267 | 38.967 | 77.934 | 116.901 |
| 6.24548619533626 | 39.006 | 78.012 | 117.018 |
| 6.24862778798985 | 39.045 | 78.091 | 117.136 |
| 6.251769380643438 | 39.085 | 78.169 | 117.254 |
| 6.254910973297028 | 39.124 | 78.248 | 117.372 |
| 6.258052565950618 | 39.163 | 78.326 | 117.49 |
| 6.261194158604208 | 39.203 | 78.405 | 117.608 |
| 6.264335751257797 | 39.242 | 78.484 | 117.726 |
| 6.267477343911387 | 39.281 | 78.563 | 117.844 |
| 6.270618936564976 | 39.321 | 78.641 | 117.962 |
| 6.273760529218566 | 39.36 | 78.72 | 118.08 |
| 6.276902121872155 | 39.4 | 78.799 | 118.199 |
| 6.280043714525745 | 39.439 | 78.878 | 118.317 |
| 6.283185307179335 | 39.478 | 78.957 | 118.435 |